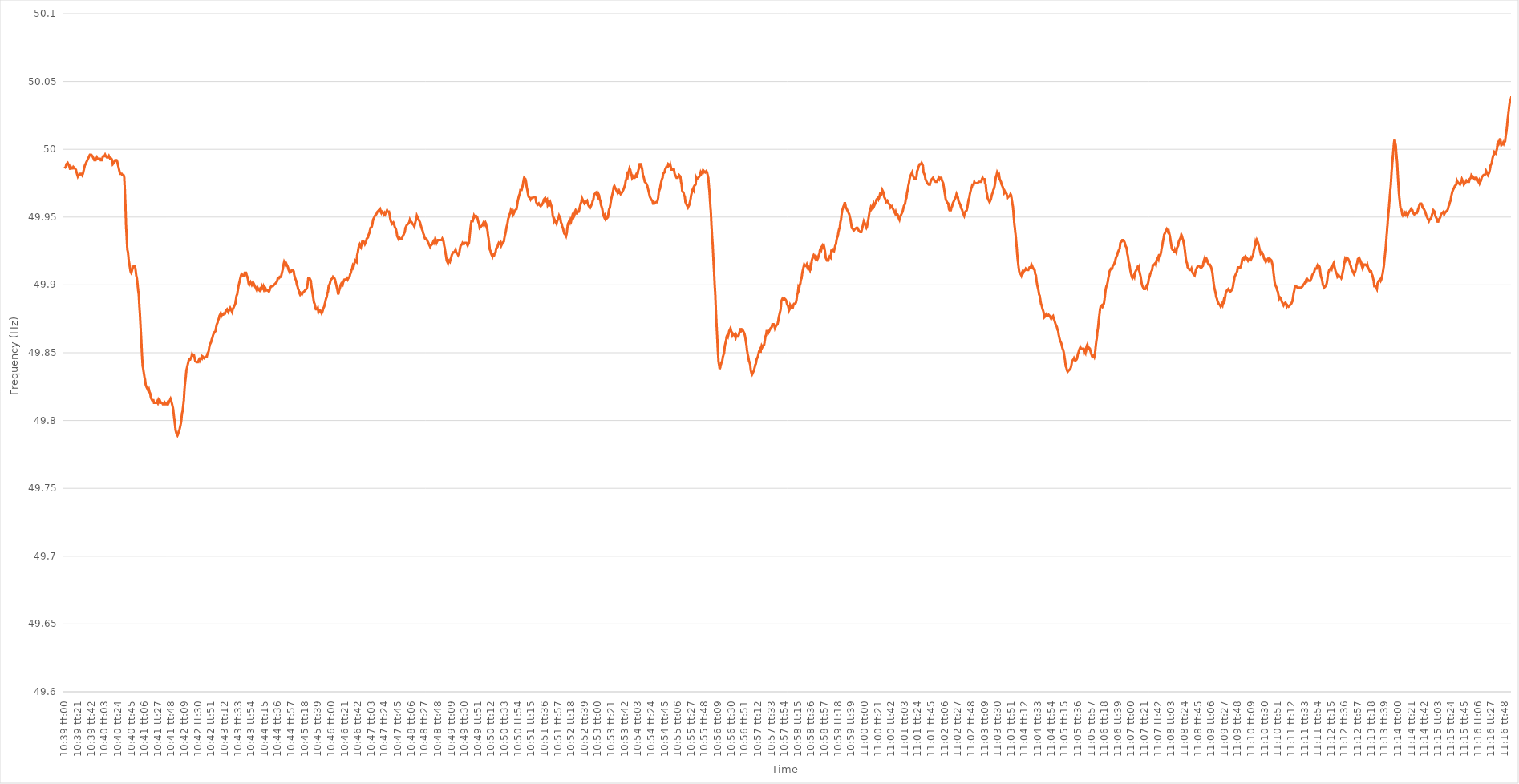
| Category | Series 0 |
|---|---|
| 0.44375000000000003 | 49.986 |
| 0.44376157407407407 | 49.986 |
| 0.44377314814814817 | 49.987 |
| 0.4437847222222222 | 49.989 |
| 0.4437962962962963 | 49.989 |
| 0.44380787037037034 | 49.99 |
| 0.4438194444444445 | 49.989 |
| 0.4438310185185185 | 49.989 |
| 0.4438425925925926 | 49.987 |
| 0.44385416666666666 | 49.985 |
| 0.44386574074074076 | 49.987 |
| 0.4438773148148148 | 49.986 |
| 0.44388888888888894 | 49.986 |
| 0.443900462962963 | 49.986 |
| 0.443912037037037 | 49.987 |
| 0.4439236111111111 | 49.987 |
| 0.44393518518518515 | 49.986 |
| 0.44394675925925925 | 49.986 |
| 0.4439583333333333 | 49.985 |
| 0.44396990740740744 | 49.983 |
| 0.4439814814814815 | 49.983 |
| 0.44399305555555557 | 49.98 |
| 0.4440046296296296 | 49.981 |
| 0.4440162037037037 | 49.981 |
| 0.44402777777777774 | 49.981 |
| 0.4440393518518519 | 49.982 |
| 0.44405092592592593 | 49.982 |
| 0.4440625 | 49.982 |
| 0.44407407407407407 | 49.981 |
| 0.44408564814814816 | 49.982 |
| 0.4440972222222222 | 49.984 |
| 0.44410879629629635 | 49.986 |
| 0.4441203703703704 | 49.988 |
| 0.4441319444444444 | 49.988 |
| 0.4441435185185185 | 49.99 |
| 0.44415509259259256 | 49.991 |
| 0.44416666666666665 | 49.992 |
| 0.4441782407407407 | 49.993 |
| 0.44418981481481484 | 49.994 |
| 0.4442013888888889 | 49.995 |
| 0.444212962962963 | 49.996 |
| 0.444224537037037 | 49.996 |
| 0.4442361111111111 | 49.996 |
| 0.44424768518518515 | 49.996 |
| 0.4442592592592593 | 49.995 |
| 0.44427083333333334 | 49.994 |
| 0.44428240740740743 | 49.994 |
| 0.44429398148148147 | 49.992 |
| 0.44430555555555556 | 49.992 |
| 0.4443171296296296 | 49.992 |
| 0.44432870370370375 | 49.992 |
| 0.4443402777777778 | 49.994 |
| 0.4443518518518519 | 49.993 |
| 0.4443634259259259 | 49.993 |
| 0.44437499999999996 | 49.993 |
| 0.44438657407407406 | 49.993 |
| 0.4443981481481481 | 49.993 |
| 0.44440972222222225 | 49.992 |
| 0.4444212962962963 | 49.992 |
| 0.4444328703703704 | 49.992 |
| 0.4444444444444444 | 49.994 |
| 0.4444560185185185 | 49.995 |
| 0.44446759259259255 | 49.995 |
| 0.4444791666666667 | 49.995 |
| 0.44449074074074074 | 49.996 |
| 0.44450231481481484 | 49.995 |
| 0.4445138888888889 | 49.995 |
| 0.44452546296296297 | 49.994 |
| 0.444537037037037 | 49.994 |
| 0.44454861111111116 | 49.994 |
| 0.4445601851851852 | 49.995 |
| 0.4445717592592593 | 49.994 |
| 0.44458333333333333 | 49.993 |
| 0.4445949074074074 | 49.993 |
| 0.44460648148148146 | 49.993 |
| 0.4446180555555555 | 49.992 |
| 0.44462962962962965 | 49.989 |
| 0.4446412037037037 | 49.989 |
| 0.4446527777777778 | 49.99 |
| 0.4446643518518518 | 49.991 |
| 0.4446759259259259 | 49.992 |
| 0.44468749999999996 | 49.992 |
| 0.4446990740740741 | 49.992 |
| 0.44471064814814815 | 49.991 |
| 0.44472222222222224 | 49.989 |
| 0.4447337962962963 | 49.987 |
| 0.4447453703703704 | 49.985 |
| 0.4447569444444444 | 49.983 |
| 0.44476851851851856 | 49.982 |
| 0.4447800925925926 | 49.982 |
| 0.4447916666666667 | 49.982 |
| 0.44480324074074074 | 49.981 |
| 0.44481481481481483 | 49.981 |
| 0.44482638888888887 | 49.981 |
| 0.444837962962963 | 49.98 |
| 0.44484953703703706 | 49.971 |
| 0.4448611111111111 | 49.959 |
| 0.4448726851851852 | 49.943 |
| 0.44488425925925923 | 49.935 |
| 0.4448958333333333 | 49.926 |
| 0.44490740740740736 | 49.924 |
| 0.4449189814814815 | 49.919 |
| 0.44493055555555555 | 49.916 |
| 0.44494212962962965 | 49.913 |
| 0.4449537037037037 | 49.91 |
| 0.4449652777777778 | 49.909 |
| 0.4449768518518518 | 49.91 |
| 0.44498842592592597 | 49.912 |
| 0.445 | 49.913 |
| 0.4450115740740741 | 49.914 |
| 0.44502314814814814 | 49.914 |
| 0.44503472222222223 | 49.914 |
| 0.4450462962962963 | 49.911 |
| 0.4450578703703704 | 49.907 |
| 0.44506944444444446 | 49.905 |
| 0.4450810185185185 | 49.901 |
| 0.4450925925925926 | 49.896 |
| 0.44510416666666663 | 49.893 |
| 0.44511574074074073 | 49.884 |
| 0.44512731481481477 | 49.877 |
| 0.4451388888888889 | 49.868 |
| 0.44515046296296296 | 49.859 |
| 0.44516203703703705 | 49.849 |
| 0.4451736111111111 | 49.841 |
| 0.4451851851851852 | 49.838 |
| 0.4451967592592592 | 49.835 |
| 0.4452083333333334 | 49.832 |
| 0.4452199074074074 | 49.83 |
| 0.4452314814814815 | 49.826 |
| 0.44524305555555554 | 49.825 |
| 0.44525462962962964 | 49.824 |
| 0.4452662037037037 | 49.823 |
| 0.44527777777777783 | 49.822 |
| 0.44528935185185187 | 49.823 |
| 0.44530092592592596 | 49.821 |
| 0.4453125 | 49.82 |
| 0.44532407407407404 | 49.817 |
| 0.44533564814814813 | 49.817 |
| 0.44534722222222217 | 49.815 |
| 0.4453587962962963 | 49.815 |
| 0.44537037037037036 | 49.815 |
| 0.44538194444444446 | 49.813 |
| 0.4453935185185185 | 49.813 |
| 0.4454050925925926 | 49.813 |
| 0.4454166666666666 | 49.813 |
| 0.4454282407407408 | 49.813 |
| 0.4454398148148148 | 49.814 |
| 0.4454513888888889 | 49.813 |
| 0.44546296296296295 | 49.815 |
| 0.44547453703703704 | 49.814 |
| 0.4454861111111111 | 49.815 |
| 0.44549768518518523 | 49.815 |
| 0.44550925925925927 | 49.813 |
| 0.44552083333333337 | 49.813 |
| 0.4455324074074074 | 49.813 |
| 0.4455439814814815 | 49.812 |
| 0.44555555555555554 | 49.812 |
| 0.4455671296296296 | 49.812 |
| 0.4455787037037037 | 49.813 |
| 0.44559027777777777 | 49.812 |
| 0.44560185185185186 | 49.812 |
| 0.4456134259259259 | 49.812 |
| 0.445625 | 49.813 |
| 0.44563657407407403 | 49.812 |
| 0.4456481481481482 | 49.813 |
| 0.4456597222222222 | 49.814 |
| 0.4456712962962963 | 49.814 |
| 0.44568287037037035 | 49.816 |
| 0.44569444444444445 | 49.816 |
| 0.4457060185185185 | 49.813 |
| 0.44571759259259264 | 49.811 |
| 0.4457291666666667 | 49.809 |
| 0.44574074074074077 | 49.805 |
| 0.4457523148148148 | 49.801 |
| 0.4457638888888889 | 49.797 |
| 0.44577546296296294 | 49.793 |
| 0.445787037037037 | 49.791 |
| 0.44579861111111113 | 49.79 |
| 0.44581018518518517 | 49.789 |
| 0.44582175925925926 | 49.79 |
| 0.4458333333333333 | 49.792 |
| 0.4458449074074074 | 49.793 |
| 0.44585648148148144 | 49.793 |
| 0.4458680555555556 | 49.797 |
| 0.4458796296296296 | 49.8 |
| 0.4458912037037037 | 49.805 |
| 0.44590277777777776 | 49.807 |
| 0.44591435185185185 | 49.811 |
| 0.4459259259259259 | 49.815 |
| 0.44593750000000004 | 49.823 |
| 0.4459490740740741 | 49.828 |
| 0.4459606481481482 | 49.832 |
| 0.4459722222222222 | 49.837 |
| 0.4459837962962963 | 49.839 |
| 0.44599537037037035 | 49.841 |
| 0.4460069444444445 | 49.841 |
| 0.44601851851851854 | 49.845 |
| 0.4460300925925926 | 49.845 |
| 0.44604166666666667 | 49.845 |
| 0.4460532407407407 | 49.846 |
| 0.4460648148148148 | 49.847 |
| 0.44607638888888884 | 49.849 |
| 0.446087962962963 | 49.848 |
| 0.44609953703703703 | 49.848 |
| 0.4461111111111111 | 49.848 |
| 0.44612268518518516 | 49.846 |
| 0.44613425925925926 | 49.844 |
| 0.4461458333333333 | 49.844 |
| 0.44615740740740745 | 49.843 |
| 0.4461689814814815 | 49.843 |
| 0.4461805555555556 | 49.843 |
| 0.4461921296296296 | 49.844 |
| 0.4462037037037037 | 49.845 |
| 0.44621527777777775 | 49.844 |
| 0.4462268518518519 | 49.844 |
| 0.44623842592592594 | 49.846 |
| 0.44625000000000004 | 49.847 |
| 0.4462615740740741 | 49.846 |
| 0.4462731481481481 | 49.847 |
| 0.4462847222222222 | 49.847 |
| 0.44629629629629625 | 49.846 |
| 0.4463078703703704 | 49.846 |
| 0.44631944444444444 | 49.847 |
| 0.44633101851851853 | 49.847 |
| 0.44634259259259257 | 49.847 |
| 0.44635416666666666 | 49.849 |
| 0.4463657407407407 | 49.85 |
| 0.44637731481481485 | 49.851 |
| 0.4463888888888889 | 49.854 |
| 0.446400462962963 | 49.856 |
| 0.446412037037037 | 49.857 |
| 0.4464236111111111 | 49.858 |
| 0.44643518518518516 | 49.86 |
| 0.4464467592592593 | 49.861 |
| 0.44645833333333335 | 49.863 |
| 0.44646990740740744 | 49.864 |
| 0.4464814814814815 | 49.865 |
| 0.4464930555555556 | 49.865 |
| 0.4465046296296296 | 49.866 |
| 0.44651620370370365 | 49.869 |
| 0.4465277777777778 | 49.871 |
| 0.44653935185185184 | 49.872 |
| 0.44655092592592593 | 49.874 |
| 0.4465625 | 49.875 |
| 0.44657407407407407 | 49.877 |
| 0.4465856481481481 | 49.878 |
| 0.44659722222222226 | 49.879 |
| 0.4466087962962963 | 49.877 |
| 0.4466203703703704 | 49.878 |
| 0.44663194444444443 | 49.878 |
| 0.4466435185185185 | 49.878 |
| 0.44665509259259256 | 49.879 |
| 0.4466666666666667 | 49.879 |
| 0.44667824074074075 | 49.879 |
| 0.44668981481481485 | 49.881 |
| 0.4467013888888889 | 49.881 |
| 0.446712962962963 | 49.882 |
| 0.446724537037037 | 49.882 |
| 0.44673611111111106 | 49.88 |
| 0.4467476851851852 | 49.881 |
| 0.44675925925925924 | 49.882 |
| 0.44677083333333334 | 49.883 |
| 0.4467824074074074 | 49.882 |
| 0.4467939814814815 | 49.881 |
| 0.4468055555555555 | 49.88 |
| 0.44681712962962966 | 49.882 |
| 0.4468287037037037 | 49.883 |
| 0.4468402777777778 | 49.884 |
| 0.44685185185185183 | 49.885 |
| 0.44686342592592593 | 49.886 |
| 0.44687499999999997 | 49.889 |
| 0.4468865740740741 | 49.892 |
| 0.44689814814814816 | 49.893 |
| 0.44690972222222225 | 49.896 |
| 0.4469212962962963 | 49.899 |
| 0.4469328703703704 | 49.901 |
| 0.4469444444444444 | 49.903 |
| 0.44695601851851857 | 49.905 |
| 0.4469675925925926 | 49.907 |
| 0.44697916666666665 | 49.908 |
| 0.44699074074074074 | 49.908 |
| 0.4470023148148148 | 49.907 |
| 0.4470138888888889 | 49.907 |
| 0.4470254629629629 | 49.907 |
| 0.44703703703703707 | 49.909 |
| 0.4470486111111111 | 49.909 |
| 0.4470601851851852 | 49.909 |
| 0.44707175925925924 | 49.907 |
| 0.44708333333333333 | 49.906 |
| 0.44709490740740737 | 49.904 |
| 0.4471064814814815 | 49.901 |
| 0.44711805555555556 | 49.9 |
| 0.44712962962962965 | 49.901 |
| 0.4471412037037037 | 49.902 |
| 0.4471527777777778 | 49.901 |
| 0.4471643518518518 | 49.9 |
| 0.447175925925926 | 49.901 |
| 0.4471875 | 49.902 |
| 0.4471990740740741 | 49.901 |
| 0.44721064814814815 | 49.9 |
| 0.4472222222222222 | 49.899 |
| 0.4472337962962963 | 49.898 |
| 0.4472453703703703 | 49.897 |
| 0.44725694444444447 | 49.896 |
| 0.4472685185185185 | 49.898 |
| 0.4472800925925926 | 49.897 |
| 0.44729166666666664 | 49.897 |
| 0.44730324074074074 | 49.896 |
| 0.4473148148148148 | 49.897 |
| 0.4473263888888889 | 49.896 |
| 0.44733796296296297 | 49.897 |
| 0.44734953703703706 | 49.899 |
| 0.4473611111111111 | 49.898 |
| 0.4473726851851852 | 49.899 |
| 0.44738425925925923 | 49.897 |
| 0.4473958333333334 | 49.898 |
| 0.4474074074074074 | 49.896 |
| 0.4474189814814815 | 49.897 |
| 0.44743055555555555 | 49.896 |
| 0.44744212962962965 | 49.896 |
| 0.4474537037037037 | 49.896 |
| 0.4474652777777777 | 49.896 |
| 0.4474768518518519 | 49.895 |
| 0.4474884259259259 | 49.896 |
| 0.4475 | 49.898 |
| 0.44751157407407405 | 49.898 |
| 0.44752314814814814 | 49.899 |
| 0.4475347222222222 | 49.899 |
| 0.44754629629629633 | 49.899 |
| 0.44755787037037037 | 49.899 |
| 0.44756944444444446 | 49.9 |
| 0.4475810185185185 | 49.9 |
| 0.4475925925925926 | 49.901 |
| 0.44760416666666664 | 49.901 |
| 0.4476157407407408 | 49.902 |
| 0.4476273148148148 | 49.903 |
| 0.4476388888888889 | 49.905 |
| 0.44765046296296296 | 49.905 |
| 0.44766203703703705 | 49.905 |
| 0.4476736111111111 | 49.906 |
| 0.44768518518518513 | 49.906 |
| 0.4476967592592593 | 49.906 |
| 0.4477083333333333 | 49.908 |
| 0.4477199074074074 | 49.91 |
| 0.44773148148148145 | 49.912 |
| 0.44774305555555555 | 49.915 |
| 0.4477546296296296 | 49.917 |
| 0.44776620370370374 | 49.917 |
| 0.4477777777777778 | 49.915 |
| 0.44778935185185187 | 49.916 |
| 0.4478009259259259 | 49.916 |
| 0.4478125 | 49.914 |
| 0.44782407407407404 | 49.913 |
| 0.4478356481481482 | 49.911 |
| 0.44784722222222223 | 49.911 |
| 0.4478587962962963 | 49.909 |
| 0.44787037037037036 | 49.909 |
| 0.44788194444444446 | 49.91 |
| 0.4478935185185185 | 49.911 |
| 0.44790509259259265 | 49.911 |
| 0.4479166666666667 | 49.911 |
| 0.4479282407407407 | 49.91 |
| 0.4479398148148148 | 49.907 |
| 0.44795138888888886 | 49.907 |
| 0.44796296296296295 | 49.904 |
| 0.447974537037037 | 49.903 |
| 0.44798611111111114 | 49.9 |
| 0.4479976851851852 | 49.899 |
| 0.4480092592592593 | 49.897 |
| 0.4480208333333333 | 49.896 |
| 0.4480324074074074 | 49.894 |
| 0.44804398148148145 | 49.893 |
| 0.4480555555555556 | 49.894 |
| 0.44806712962962963 | 49.894 |
| 0.44807870370370373 | 49.893 |
| 0.44809027777777777 | 49.894 |
| 0.44810185185185186 | 49.894 |
| 0.4481134259259259 | 49.895 |
| 0.44812500000000005 | 49.895 |
| 0.4481365740740741 | 49.896 |
| 0.4481481481481482 | 49.896 |
| 0.4481597222222222 | 49.897 |
| 0.44817129629629626 | 49.898 |
| 0.44818287037037036 | 49.901 |
| 0.4481944444444444 | 49.905 |
| 0.44820601851851855 | 49.905 |
| 0.4482175925925926 | 49.905 |
| 0.4482291666666667 | 49.904 |
| 0.4482407407407407 | 49.903 |
| 0.4482523148148148 | 49.899 |
| 0.44826388888888885 | 49.896 |
| 0.448275462962963 | 49.893 |
| 0.44828703703703704 | 49.89 |
| 0.44829861111111113 | 49.887 |
| 0.4483101851851852 | 49.886 |
| 0.44832175925925927 | 49.884 |
| 0.4483333333333333 | 49.882 |
| 0.44834490740740746 | 49.882 |
| 0.4483564814814815 | 49.882 |
| 0.4483680555555556 | 49.883 |
| 0.44837962962962963 | 49.88 |
| 0.44839120370370367 | 49.881 |
| 0.44840277777777776 | 49.881 |
| 0.4484143518518518 | 49.881 |
| 0.44842592592592595 | 49.88 |
| 0.4484375 | 49.879 |
| 0.4484490740740741 | 49.88 |
| 0.4484606481481481 | 49.88 |
| 0.4484722222222222 | 49.883 |
| 0.44848379629629626 | 49.884 |
| 0.4484953703703704 | 49.886 |
| 0.44850694444444444 | 49.888 |
| 0.44851851851851854 | 49.89 |
| 0.4485300925925926 | 49.891 |
| 0.44854166666666667 | 49.894 |
| 0.4485532407407407 | 49.895 |
| 0.44856481481481486 | 49.899 |
| 0.4485763888888889 | 49.899 |
| 0.448587962962963 | 49.901 |
| 0.44859953703703703 | 49.903 |
| 0.4486111111111111 | 49.904 |
| 0.44862268518518517 | 49.904 |
| 0.4486342592592592 | 49.905 |
| 0.44864583333333335 | 49.906 |
| 0.4486574074074074 | 49.906 |
| 0.4486689814814815 | 49.905 |
| 0.4486805555555555 | 49.904 |
| 0.4486921296296296 | 49.902 |
| 0.44870370370370366 | 49.9 |
| 0.4487152777777778 | 49.898 |
| 0.44872685185185185 | 49.896 |
| 0.44873842592592594 | 49.893 |
| 0.44875 | 49.895 |
| 0.4487615740740741 | 49.895 |
| 0.4487731481481481 | 49.898 |
| 0.44878472222222227 | 49.9 |
| 0.4487962962962963 | 49.901 |
| 0.4488078703703704 | 49.901 |
| 0.44881944444444444 | 49.9 |
| 0.44883101851851853 | 49.902 |
| 0.44884259259259257 | 49.903 |
| 0.4488541666666667 | 49.904 |
| 0.44886574074074076 | 49.904 |
| 0.4488773148148148 | 49.904 |
| 0.4488888888888889 | 49.904 |
| 0.44890046296296293 | 49.905 |
| 0.448912037037037 | 49.904 |
| 0.44892361111111106 | 49.905 |
| 0.4489351851851852 | 49.905 |
| 0.44894675925925925 | 49.906 |
| 0.44895833333333335 | 49.908 |
| 0.4489699074074074 | 49.909 |
| 0.4489814814814815 | 49.911 |
| 0.4489930555555555 | 49.912 |
| 0.44900462962962967 | 49.914 |
| 0.4490162037037037 | 49.913 |
| 0.4490277777777778 | 49.915 |
| 0.44903935185185184 | 49.915 |
| 0.44905092592592594 | 49.918 |
| 0.4490625 | 49.918 |
| 0.4490740740740741 | 49.917 |
| 0.44908564814814816 | 49.922 |
| 0.44909722222222226 | 49.924 |
| 0.4491087962962963 | 49.927 |
| 0.44912037037037034 | 49.929 |
| 0.44913194444444443 | 49.93 |
| 0.44914351851851847 | 49.929 |
| 0.4491550925925926 | 49.928 |
| 0.44916666666666666 | 49.93 |
| 0.44917824074074075 | 49.932 |
| 0.4491898148148148 | 49.932 |
| 0.4492013888888889 | 49.932 |
| 0.4492129629629629 | 49.931 |
| 0.4492245370370371 | 49.93 |
| 0.4492361111111111 | 49.93 |
| 0.4492476851851852 | 49.932 |
| 0.44925925925925925 | 49.934 |
| 0.44927083333333334 | 49.934 |
| 0.4492824074074074 | 49.935 |
| 0.44929398148148153 | 49.937 |
| 0.44930555555555557 | 49.938 |
| 0.44931712962962966 | 49.94 |
| 0.4493287037037037 | 49.942 |
| 0.44934027777777774 | 49.942 |
| 0.44935185185185184 | 49.943 |
| 0.4493634259259259 | 49.945 |
| 0.449375 | 49.948 |
| 0.44938657407407406 | 49.949 |
| 0.44939814814814816 | 49.95 |
| 0.4494097222222222 | 49.951 |
| 0.4494212962962963 | 49.951 |
| 0.44943287037037033 | 49.952 |
| 0.4494444444444445 | 49.953 |
| 0.4494560185185185 | 49.954 |
| 0.4494675925925926 | 49.954 |
| 0.44947916666666665 | 49.955 |
| 0.44949074074074075 | 49.955 |
| 0.4495023148148148 | 49.956 |
| 0.44951388888888894 | 49.954 |
| 0.449525462962963 | 49.953 |
| 0.44953703703703707 | 49.954 |
| 0.4495486111111111 | 49.954 |
| 0.4495601851851852 | 49.953 |
| 0.44957175925925924 | 49.952 |
| 0.4495833333333333 | 49.953 |
| 0.44959490740740743 | 49.952 |
| 0.44960648148148147 | 49.953 |
| 0.44961805555555556 | 49.954 |
| 0.4496296296296296 | 49.955 |
| 0.4496412037037037 | 49.954 |
| 0.44965277777777773 | 49.954 |
| 0.4496643518518519 | 49.954 |
| 0.4496759259259259 | 49.952 |
| 0.4496875 | 49.949 |
| 0.44969907407407406 | 49.947 |
| 0.44971064814814815 | 49.946 |
| 0.4497222222222222 | 49.945 |
| 0.44973379629629634 | 49.945 |
| 0.4497453703703704 | 49.946 |
| 0.4497569444444445 | 49.945 |
| 0.4497685185185185 | 49.943 |
| 0.4497800925925926 | 49.942 |
| 0.44979166666666665 | 49.941 |
| 0.4498032407407408 | 49.939 |
| 0.44981481481481483 | 49.936 |
| 0.4498263888888889 | 49.935 |
| 0.44983796296296297 | 49.934 |
| 0.449849537037037 | 49.935 |
| 0.4498611111111111 | 49.935 |
| 0.44987268518518514 | 49.934 |
| 0.4498842592592593 | 49.934 |
| 0.44989583333333333 | 49.934 |
| 0.4499074074074074 | 49.935 |
| 0.44991898148148146 | 49.936 |
| 0.44993055555555556 | 49.937 |
| 0.4499421296296296 | 49.937 |
| 0.44995370370370374 | 49.939 |
| 0.4499652777777778 | 49.942 |
| 0.4499768518518519 | 49.943 |
| 0.4499884259259259 | 49.944 |
| 0.45 | 49.944 |
| 0.45001157407407405 | 49.945 |
| 0.4500231481481482 | 49.945 |
| 0.45003472222222224 | 49.946 |
| 0.45004629629629633 | 49.948 |
| 0.45005787037037037 | 49.947 |
| 0.4500694444444444 | 49.947 |
| 0.4500810185185185 | 49.946 |
| 0.45009259259259254 | 49.945 |
| 0.4501041666666667 | 49.945 |
| 0.45011574074074073 | 49.944 |
| 0.4501273148148148 | 49.943 |
| 0.45013888888888887 | 49.945 |
| 0.45015046296296296 | 49.947 |
| 0.450162037037037 | 49.948 |
| 0.45017361111111115 | 49.951 |
| 0.4501851851851852 | 49.95 |
| 0.4501967592592593 | 49.949 |
| 0.4502083333333333 | 49.948 |
| 0.4502199074074074 | 49.948 |
| 0.45023148148148145 | 49.946 |
| 0.4502430555555556 | 49.944 |
| 0.45025462962962964 | 49.944 |
| 0.45026620370370374 | 49.941 |
| 0.4502777777777778 | 49.94 |
| 0.4502893518518518 | 49.938 |
| 0.4503009259259259 | 49.937 |
| 0.45031249999999995 | 49.935 |
| 0.4503240740740741 | 49.934 |
| 0.45033564814814814 | 49.934 |
| 0.45034722222222223 | 49.934 |
| 0.45035879629629627 | 49.933 |
| 0.45037037037037037 | 49.933 |
| 0.4503819444444444 | 49.931 |
| 0.45039351851851855 | 49.93 |
| 0.4504050925925926 | 49.929 |
| 0.4504166666666667 | 49.928 |
| 0.4504282407407407 | 49.929 |
| 0.4504398148148148 | 49.929 |
| 0.45045138888888886 | 49.93 |
| 0.450462962962963 | 49.931 |
| 0.45047453703703705 | 49.932 |
| 0.45048611111111114 | 49.931 |
| 0.4504976851851852 | 49.932 |
| 0.4505092592592593 | 49.934 |
| 0.4505208333333333 | 49.934 |
| 0.45053240740740735 | 49.931 |
| 0.4505439814814815 | 49.931 |
| 0.45055555555555554 | 49.933 |
| 0.45056712962962964 | 49.933 |
| 0.4505787037037037 | 49.933 |
| 0.45059027777777777 | 49.933 |
| 0.4506018518518518 | 49.933 |
| 0.45061342592592596 | 49.933 |
| 0.450625 | 49.933 |
| 0.4506365740740741 | 49.934 |
| 0.45064814814814813 | 49.933 |
| 0.4506597222222222 | 49.932 |
| 0.45067129629629626 | 49.929 |
| 0.4506828703703704 | 49.927 |
| 0.45069444444444445 | 49.924 |
| 0.45070601851851855 | 49.921 |
| 0.4507175925925926 | 49.918 |
| 0.4507291666666667 | 49.917 |
| 0.4507407407407407 | 49.916 |
| 0.45075231481481487 | 49.918 |
| 0.4507638888888889 | 49.918 |
| 0.45077546296296295 | 49.917 |
| 0.45078703703703704 | 49.919 |
| 0.4507986111111111 | 49.92 |
| 0.4508101851851852 | 49.922 |
| 0.4508217592592592 | 49.922 |
| 0.45083333333333336 | 49.924 |
| 0.4508449074074074 | 49.924 |
| 0.4508564814814815 | 49.924 |
| 0.45086805555555554 | 49.925 |
| 0.45087962962962963 | 49.926 |
| 0.45089120370370367 | 49.924 |
| 0.4509027777777778 | 49.924 |
| 0.45091435185185186 | 49.923 |
| 0.45092592592592595 | 49.922 |
| 0.4509375 | 49.922 |
| 0.4509490740740741 | 49.924 |
| 0.4509606481481481 | 49.927 |
| 0.4509722222222223 | 49.929 |
| 0.4509837962962963 | 49.929 |
| 0.45099537037037035 | 49.93 |
| 0.45100694444444445 | 49.931 |
| 0.4510185185185185 | 49.931 |
| 0.4510300925925926 | 49.93 |
| 0.4510416666666666 | 49.93 |
| 0.45105324074074077 | 49.931 |
| 0.4510648148148148 | 49.931 |
| 0.4510763888888889 | 49.931 |
| 0.45108796296296294 | 49.93 |
| 0.45109953703703703 | 49.929 |
| 0.4511111111111111 | 49.929 |
| 0.4511226851851852 | 49.931 |
| 0.45113425925925926 | 49.935 |
| 0.45114583333333336 | 49.94 |
| 0.4511574074074074 | 49.944 |
| 0.4511689814814815 | 49.947 |
| 0.45118055555555553 | 49.947 |
| 0.4511921296296297 | 49.947 |
| 0.4512037037037037 | 49.949 |
| 0.4512152777777778 | 49.951 |
| 0.45122685185185185 | 49.95 |
| 0.4512384259259259 | 49.95 |
| 0.45125 | 49.951 |
| 0.451261574074074 | 49.951 |
| 0.4512731481481482 | 49.95 |
| 0.4512847222222222 | 49.948 |
| 0.4512962962962963 | 49.946 |
| 0.45130787037037035 | 49.945 |
| 0.45131944444444444 | 49.942 |
| 0.4513310185185185 | 49.942 |
| 0.45134259259259263 | 49.943 |
| 0.45135416666666667 | 49.943 |
| 0.45136574074074076 | 49.944 |
| 0.4513773148148148 | 49.944 |
| 0.4513888888888889 | 49.946 |
| 0.45140046296296293 | 49.944 |
| 0.4514120370370371 | 49.945 |
| 0.4514236111111111 | 49.946 |
| 0.4514351851851852 | 49.945 |
| 0.45144675925925926 | 49.942 |
| 0.45145833333333335 | 49.941 |
| 0.4514699074074074 | 49.937 |
| 0.45148148148148143 | 49.934 |
| 0.4514930555555556 | 49.93 |
| 0.4515046296296296 | 49.926 |
| 0.4515162037037037 | 49.925 |
| 0.45152777777777775 | 49.923 |
| 0.45153935185185184 | 49.922 |
| 0.4515509259259259 | 49.921 |
| 0.45156250000000003 | 49.923 |
| 0.45157407407407407 | 49.921 |
| 0.45158564814814817 | 49.923 |
| 0.4515972222222222 | 49.923 |
| 0.4516087962962963 | 49.924 |
| 0.45162037037037034 | 49.927 |
| 0.4516319444444445 | 49.927 |
| 0.4516435185185185 | 49.928 |
| 0.4516550925925926 | 49.93 |
| 0.45166666666666666 | 49.931 |
| 0.45167824074074076 | 49.931 |
| 0.4516898148148148 | 49.93 |
| 0.45170138888888894 | 49.931 |
| 0.451712962962963 | 49.929 |
| 0.451724537037037 | 49.93 |
| 0.4517361111111111 | 49.931 |
| 0.45174768518518515 | 49.931 |
| 0.45175925925925925 | 49.932 |
| 0.4517708333333333 | 49.935 |
| 0.45178240740740744 | 49.937 |
| 0.4517939814814815 | 49.939 |
| 0.45180555555555557 | 49.942 |
| 0.4518171296296296 | 49.942 |
| 0.4518287037037037 | 49.946 |
| 0.45184027777777774 | 49.949 |
| 0.4518518518518519 | 49.95 |
| 0.45186342592592593 | 49.952 |
| 0.451875 | 49.953 |
| 0.45188657407407407 | 49.955 |
| 0.45189814814814816 | 49.954 |
| 0.4519097222222222 | 49.953 |
| 0.45192129629629635 | 49.952 |
| 0.4519328703703704 | 49.954 |
| 0.4519444444444444 | 49.953 |
| 0.4519560185185185 | 49.954 |
| 0.45196759259259256 | 49.955 |
| 0.45197916666666665 | 49.955 |
| 0.4519907407407407 | 49.956 |
| 0.45200231481481484 | 49.959 |
| 0.4520138888888889 | 49.962 |
| 0.452025462962963 | 49.962 |
| 0.452037037037037 | 49.966 |
| 0.4520486111111111 | 49.967 |
| 0.45206018518518515 | 49.97 |
| 0.4520717592592593 | 49.97 |
| 0.45208333333333334 | 49.97 |
| 0.45209490740740743 | 49.972 |
| 0.45210648148148147 | 49.974 |
| 0.45211805555555556 | 49.977 |
| 0.4521296296296296 | 49.979 |
| 0.45214120370370375 | 49.979 |
| 0.4521527777777778 | 49.978 |
| 0.4521643518518519 | 49.976 |
| 0.4521759259259259 | 49.972 |
| 0.45218749999999996 | 49.97 |
| 0.45219907407407406 | 49.967 |
| 0.4522106481481481 | 49.965 |
| 0.45222222222222225 | 49.965 |
| 0.4522337962962963 | 49.964 |
| 0.4522453703703704 | 49.963 |
| 0.4522569444444444 | 49.964 |
| 0.4522685185185185 | 49.964 |
| 0.45228009259259255 | 49.964 |
| 0.4522916666666667 | 49.964 |
| 0.45230324074074074 | 49.965 |
| 0.45231481481481484 | 49.965 |
| 0.4523263888888889 | 49.965 |
| 0.45233796296296297 | 49.964 |
| 0.452349537037037 | 49.961 |
| 0.45236111111111116 | 49.961 |
| 0.4523726851851852 | 49.959 |
| 0.4523842592592593 | 49.959 |
| 0.45239583333333333 | 49.96 |
| 0.4524074074074074 | 49.959 |
| 0.45241898148148146 | 49.959 |
| 0.4524305555555555 | 49.958 |
| 0.45244212962962965 | 49.958 |
| 0.4524537037037037 | 49.959 |
| 0.4524652777777778 | 49.96 |
| 0.4524768518518518 | 49.961 |
| 0.4524884259259259 | 49.963 |
| 0.45249999999999996 | 49.963 |
| 0.4525115740740741 | 49.964 |
| 0.45252314814814815 | 49.962 |
| 0.45253472222222224 | 49.962 |
| 0.4525462962962963 | 49.963 |
| 0.4525578703703704 | 49.959 |
| 0.4525694444444444 | 49.96 |
| 0.45258101851851856 | 49.958 |
| 0.4525925925925926 | 49.96 |
| 0.4526041666666667 | 49.961 |
| 0.45261574074074074 | 49.961 |
| 0.45262731481481483 | 49.958 |
| 0.45263888888888887 | 49.956 |
| 0.452650462962963 | 49.951 |
| 0.45266203703703706 | 49.95 |
| 0.4526736111111111 | 49.947 |
| 0.4526851851851852 | 49.948 |
| 0.45269675925925923 | 49.947 |
| 0.4527083333333333 | 49.946 |
| 0.45271990740740736 | 49.945 |
| 0.4527314814814815 | 49.947 |
| 0.45274305555555555 | 49.948 |
| 0.45275462962962965 | 49.949 |
| 0.4527662037037037 | 49.951 |
| 0.4527777777777778 | 49.95 |
| 0.4527893518518518 | 49.949 |
| 0.45280092592592597 | 49.946 |
| 0.4528125 | 49.945 |
| 0.4528240740740741 | 49.943 |
| 0.45283564814814814 | 49.942 |
| 0.45284722222222223 | 49.94 |
| 0.4528587962962963 | 49.938 |
| 0.4528703703703704 | 49.938 |
| 0.45288194444444446 | 49.937 |
| 0.4528935185185185 | 49.936 |
| 0.4529050925925926 | 49.938 |
| 0.45291666666666663 | 49.942 |
| 0.45292824074074073 | 49.945 |
| 0.45293981481481477 | 49.945 |
| 0.4529513888888889 | 49.947 |
| 0.45296296296296296 | 49.946 |
| 0.45297453703703705 | 49.948 |
| 0.4529861111111111 | 49.947 |
| 0.4529976851851852 | 49.949 |
| 0.4530092592592592 | 49.951 |
| 0.4530208333333334 | 49.953 |
| 0.4530324074074074 | 49.95 |
| 0.4530439814814815 | 49.951 |
| 0.45305555555555554 | 49.954 |
| 0.45306712962962964 | 49.955 |
| 0.4530787037037037 | 49.954 |
| 0.45309027777777783 | 49.952 |
| 0.45310185185185187 | 49.954 |
| 0.45311342592592596 | 49.954 |
| 0.453125 | 49.954 |
| 0.45313657407407404 | 49.956 |
| 0.45314814814814813 | 49.958 |
| 0.45315972222222217 | 49.96 |
| 0.4531712962962963 | 49.961 |
| 0.45318287037037036 | 49.964 |
| 0.45319444444444446 | 49.963 |
| 0.4532060185185185 | 49.962 |
| 0.4532175925925926 | 49.961 |
| 0.4532291666666666 | 49.96 |
| 0.4532407407407408 | 49.96 |
| 0.4532523148148148 | 49.961 |
| 0.4532638888888889 | 49.961 |
| 0.45327546296296295 | 49.962 |
| 0.45328703703703704 | 49.96 |
| 0.4532986111111111 | 49.96 |
| 0.45331018518518523 | 49.958 |
| 0.45332175925925927 | 49.958 |
| 0.45333333333333337 | 49.957 |
| 0.4533449074074074 | 49.958 |
| 0.4533564814814815 | 49.958 |
| 0.45336805555555554 | 49.96 |
| 0.4533796296296296 | 49.962 |
| 0.4533912037037037 | 49.963 |
| 0.45340277777777777 | 49.966 |
| 0.45341435185185186 | 49.967 |
| 0.4534259259259259 | 49.967 |
| 0.4534375 | 49.968 |
| 0.45344907407407403 | 49.967 |
| 0.4534606481481482 | 49.967 |
| 0.4534722222222222 | 49.965 |
| 0.4534837962962963 | 49.967 |
| 0.45349537037037035 | 49.966 |
| 0.45350694444444445 | 49.963 |
| 0.4535185185185185 | 49.962 |
| 0.45353009259259264 | 49.959 |
| 0.4535416666666667 | 49.959 |
| 0.45355324074074077 | 49.956 |
| 0.4535648148148148 | 49.953 |
| 0.4535763888888889 | 49.951 |
| 0.45358796296296294 | 49.95 |
| 0.453599537037037 | 49.951 |
| 0.45361111111111113 | 49.949 |
| 0.45362268518518517 | 49.95 |
| 0.45363425925925926 | 49.949 |
| 0.4536458333333333 | 49.949 |
| 0.4536574074074074 | 49.95 |
| 0.45366898148148144 | 49.954 |
| 0.4536805555555556 | 49.956 |
| 0.4536921296296296 | 49.957 |
| 0.4537037037037037 | 49.96 |
| 0.45371527777777776 | 49.963 |
| 0.45372685185185185 | 49.965 |
| 0.4537384259259259 | 49.967 |
| 0.45375000000000004 | 49.969 |
| 0.4537615740740741 | 49.972 |
| 0.4537731481481482 | 49.973 |
| 0.4537847222222222 | 49.972 |
| 0.4537962962962963 | 49.971 |
| 0.45380787037037035 | 49.97 |
| 0.4538194444444445 | 49.97 |
| 0.45383101851851854 | 49.968 |
| 0.4538425925925926 | 49.969 |
| 0.45385416666666667 | 49.967 |
| 0.4538657407407407 | 49.969 |
| 0.4538773148148148 | 49.968 |
| 0.45388888888888884 | 49.967 |
| 0.453900462962963 | 49.967 |
| 0.45391203703703703 | 49.968 |
| 0.4539236111111111 | 49.969 |
| 0.45393518518518516 | 49.97 |
| 0.45394675925925926 | 49.971 |
| 0.4539583333333333 | 49.971 |
| 0.45396990740740745 | 49.974 |
| 0.4539814814814815 | 49.977 |
| 0.4539930555555556 | 49.978 |
| 0.4540046296296296 | 49.981 |
| 0.4540162037037037 | 49.98 |
| 0.45402777777777775 | 49.983 |
| 0.4540393518518519 | 49.984 |
| 0.45405092592592594 | 49.986 |
| 0.45406250000000004 | 49.985 |
| 0.4540740740740741 | 49.983 |
| 0.4540856481481481 | 49.981 |
| 0.4540972222222222 | 49.979 |
| 0.45410879629629625 | 49.98 |
| 0.4541203703703704 | 49.979 |
| 0.45413194444444444 | 49.979 |
| 0.45414351851851853 | 49.979 |
| 0.45415509259259257 | 49.979 |
| 0.45416666666666666 | 49.981 |
| 0.4541782407407407 | 49.979 |
| 0.45418981481481485 | 49.979 |
| 0.4542013888888889 | 49.983 |
| 0.454212962962963 | 49.985 |
| 0.454224537037037 | 49.986 |
| 0.4542361111111111 | 49.989 |
| 0.45424768518518516 | 49.989 |
| 0.4542592592592593 | 49.989 |
| 0.45427083333333335 | 49.987 |
| 0.45428240740740744 | 49.985 |
| 0.4542939814814815 | 49.981 |
| 0.4543055555555556 | 49.98 |
| 0.4543171296296296 | 49.978 |
| 0.45432870370370365 | 49.976 |
| 0.4543402777777778 | 49.976 |
| 0.45435185185185184 | 49.975 |
| 0.45436342592592593 | 49.974 |
| 0.454375 | 49.973 |
| 0.45438657407407407 | 49.971 |
| 0.4543981481481481 | 49.969 |
| 0.45440972222222226 | 49.969 |
| 0.4544212962962963 | 49.965 |
| 0.4544328703703704 | 49.965 |
| 0.45444444444444443 | 49.963 |
| 0.4544560185185185 | 49.963 |
| 0.45446759259259256 | 49.962 |
| 0.4544791666666667 | 49.96 |
| 0.45449074074074075 | 49.96 |
| 0.45450231481481485 | 49.96 |
| 0.4545138888888889 | 49.96 |
| 0.454525462962963 | 49.961 |
| 0.454537037037037 | 49.961 |
| 0.45454861111111106 | 49.961 |
| 0.4545601851851852 | 49.962 |
| 0.45457175925925924 | 49.964 |
| 0.45458333333333334 | 49.968 |
| 0.4545949074074074 | 49.97 |
| 0.4546064814814815 | 49.971 |
| 0.4546180555555555 | 49.974 |
| 0.45462962962962966 | 49.976 |
| 0.4546412037037037 | 49.978 |
| 0.4546527777777778 | 49.979 |
| 0.45466435185185183 | 49.982 |
| 0.45467592592592593 | 49.982 |
| 0.45468749999999997 | 49.983 |
| 0.4546990740740741 | 49.985 |
| 0.45471064814814816 | 49.986 |
| 0.45472222222222225 | 49.987 |
| 0.4547337962962963 | 49.987 |
| 0.4547453703703704 | 49.987 |
| 0.4547569444444444 | 49.989 |
| 0.45476851851851857 | 49.989 |
| 0.4547800925925926 | 49.988 |
| 0.45479166666666665 | 49.989 |
| 0.45480324074074074 | 49.987 |
| 0.4548148148148148 | 49.985 |
| 0.4548263888888889 | 49.985 |
| 0.4548379629629629 | 49.985 |
| 0.45484953703703707 | 49.985 |
| 0.4548611111111111 | 49.985 |
| 0.4548726851851852 | 49.982 |
| 0.45488425925925924 | 49.981 |
| 0.45489583333333333 | 49.98 |
| 0.45490740740740737 | 49.979 |
| 0.4549189814814815 | 49.979 |
| 0.45493055555555556 | 49.979 |
| 0.45494212962962965 | 49.979 |
| 0.4549537037037037 | 49.981 |
| 0.4549652777777778 | 49.981 |
| 0.4549768518518518 | 49.98 |
| 0.454988425925926 | 49.976 |
| 0.455 | 49.974 |
| 0.4550115740740741 | 49.969 |
| 0.45502314814814815 | 49.969 |
| 0.4550347222222222 | 49.968 |
| 0.4550462962962963 | 49.966 |
| 0.4550578703703703 | 49.965 |
| 0.45506944444444447 | 49.961 |
| 0.4550810185185185 | 49.96 |
| 0.4550925925925926 | 49.959 |
| 0.45510416666666664 | 49.958 |
| 0.45511574074074074 | 49.957 |
| 0.4551273148148148 | 49.958 |
| 0.4551388888888889 | 49.959 |
| 0.45515046296296297 | 49.961 |
| 0.45516203703703706 | 49.963 |
| 0.4551736111111111 | 49.966 |
| 0.4551851851851852 | 49.968 |
| 0.45519675925925923 | 49.97 |
| 0.4552083333333334 | 49.971 |
| 0.4552199074074074 | 49.97 |
| 0.4552314814814815 | 49.973 |
| 0.45524305555555555 | 49.973 |
| 0.45525462962962965 | 49.974 |
| 0.4552662037037037 | 49.979 |
| 0.4552777777777777 | 49.978 |
| 0.4552893518518519 | 49.978 |
| 0.4553009259259259 | 49.979 |
| 0.4553125 | 49.979 |
| 0.45532407407407405 | 49.98 |
| 0.45533564814814814 | 49.981 |
| 0.4553472222222222 | 49.983 |
| 0.45535879629629633 | 49.982 |
| 0.45537037037037037 | 49.983 |
| 0.45538194444444446 | 49.984 |
| 0.4553935185185185 | 49.983 |
| 0.4554050925925926 | 49.984 |
| 0.45541666666666664 | 49.984 |
| 0.4554282407407408 | 49.983 |
| 0.4554398148148148 | 49.983 |
| 0.4554513888888889 | 49.984 |
| 0.45546296296296296 | 49.983 |
| 0.45547453703703705 | 49.983 |
| 0.4554861111111111 | 49.979 |
| 0.45549768518518513 | 49.973 |
| 0.4555092592592593 | 49.968 |
| 0.4555208333333333 | 49.96 |
| 0.4555324074074074 | 49.954 |
| 0.45554398148148145 | 49.944 |
| 0.45555555555555555 | 49.936 |
| 0.4555671296296296 | 49.929 |
| 0.45557870370370374 | 49.919 |
| 0.4555902777777778 | 49.911 |
| 0.45560185185185187 | 49.901 |
| 0.4556134259259259 | 49.893 |
| 0.455625 | 49.881 |
| 0.45563657407407404 | 49.871 |
| 0.4556481481481482 | 49.862 |
| 0.45565972222222223 | 49.852 |
| 0.4556712962962963 | 49.844 |
| 0.45568287037037036 | 49.841 |
| 0.45569444444444446 | 49.838 |
| 0.4557060185185185 | 49.84 |
| 0.45571759259259265 | 49.84 |
| 0.4557291666666667 | 49.843 |
| 0.4557407407407407 | 49.844 |
| 0.4557523148148148 | 49.847 |
| 0.45576388888888886 | 49.847 |
| 0.45577546296296295 | 49.85 |
| 0.455787037037037 | 49.855 |
| 0.45579861111111114 | 49.857 |
| 0.4558101851851852 | 49.859 |
| 0.4558217592592593 | 49.862 |
| 0.4558333333333333 | 49.863 |
| 0.4558449074074074 | 49.862 |
| 0.45585648148148145 | 49.864 |
| 0.4558680555555556 | 49.866 |
| 0.45587962962962963 | 49.867 |
| 0.45589120370370373 | 49.868 |
| 0.45590277777777777 | 49.866 |
| 0.45591435185185186 | 49.865 |
| 0.4559259259259259 | 49.863 |
| 0.45593750000000005 | 49.864 |
| 0.4559490740740741 | 49.864 |
| 0.4559606481481482 | 49.863 |
| 0.4559722222222222 | 49.863 |
| 0.45598379629629626 | 49.861 |
| 0.45599537037037036 | 49.863 |
| 0.4560069444444444 | 49.862 |
| 0.45601851851851855 | 49.862 |
| 0.4560300925925926 | 49.862 |
| 0.4560416666666667 | 49.863 |
| 0.4560532407407407 | 49.865 |
| 0.4560648148148148 | 49.866 |
| 0.45607638888888885 | 49.868 |
| 0.456087962962963 | 49.866 |
| 0.45609953703703704 | 49.866 |
| 0.45611111111111113 | 49.867 |
| 0.4561226851851852 | 49.866 |
| 0.45613425925925927 | 49.866 |
| 0.4561458333333333 | 49.864 |
| 0.45615740740740746 | 49.862 |
| 0.4561689814814815 | 49.859 |
| 0.4561805555555556 | 49.856 |
| 0.45619212962962963 | 49.852 |
| 0.45620370370370367 | 49.849 |
| 0.45621527777777776 | 49.847 |
| 0.4562268518518518 | 49.844 |
| 0.45623842592592595 | 49.843 |
| 0.45625 | 49.841 |
| 0.4562615740740741 | 49.837 |
| 0.4562731481481481 | 49.835 |
| 0.4562847222222222 | 49.834 |
| 0.45629629629629626 | 49.835 |
| 0.4563078703703704 | 49.835 |
| 0.45631944444444444 | 49.837 |
| 0.45633101851851854 | 49.839 |
| 0.4563425925925926 | 49.841 |
| 0.45635416666666667 | 49.842 |
| 0.4563657407407407 | 49.845 |
| 0.45637731481481486 | 49.846 |
| 0.4563888888888889 | 49.847 |
| 0.456400462962963 | 49.849 |
| 0.45641203703703703 | 49.851 |
| 0.4564236111111111 | 49.852 |
| 0.45643518518518517 | 49.85 |
| 0.4564467592592592 | 49.853 |
| 0.45645833333333335 | 49.855 |
| 0.4564699074074074 | 49.854 |
| 0.4564814814814815 | 49.855 |
| 0.4564930555555555 | 49.855 |
| 0.4565046296296296 | 49.856 |
| 0.45651620370370366 | 49.859 |
| 0.4565277777777778 | 49.862 |
| 0.45653935185185185 | 49.863 |
| 0.45655092592592594 | 49.866 |
| 0.4565625 | 49.866 |
| 0.4565740740740741 | 49.866 |
| 0.4565856481481481 | 49.865 |
| 0.45659722222222227 | 49.866 |
| 0.4566087962962963 | 49.867 |
| 0.4566203703703704 | 49.868 |
| 0.45663194444444444 | 49.868 |
| 0.45664351851851853 | 49.869 |
| 0.45665509259259257 | 49.871 |
| 0.4566666666666667 | 49.871 |
| 0.45667824074074076 | 49.871 |
| 0.4566898148148148 | 49.87 |
| 0.4567013888888889 | 49.868 |
| 0.45671296296296293 | 49.869 |
| 0.456724537037037 | 49.87 |
| 0.45673611111111106 | 49.87 |
| 0.4567476851851852 | 49.871 |
| 0.45675925925925925 | 49.873 |
| 0.45677083333333335 | 49.876 |
| 0.4567824074074074 | 49.878 |
| 0.4567939814814815 | 49.88 |
| 0.4568055555555555 | 49.882 |
| 0.45681712962962967 | 49.888 |
| 0.4568287037037037 | 49.889 |
| 0.4568402777777778 | 49.89 |
| 0.45685185185185184 | 49.89 |
| 0.45686342592592594 | 49.889 |
| 0.456875 | 49.89 |
| 0.4568865740740741 | 49.89 |
| 0.45689814814814816 | 49.889 |
| 0.45690972222222226 | 49.888 |
| 0.4569212962962963 | 49.886 |
| 0.45693287037037034 | 49.886 |
| 0.45694444444444443 | 49.884 |
| 0.45695601851851847 | 49.881 |
| 0.4569675925925926 | 49.882 |
| 0.45697916666666666 | 49.885 |
| 0.45699074074074075 | 49.885 |
| 0.4570023148148148 | 49.883 |
| 0.4570138888888889 | 49.883 |
| 0.4570254629629629 | 49.883 |
| 0.4570370370370371 | 49.885 |
| 0.4570486111111111 | 49.886 |
| 0.4570601851851852 | 49.886 |
| 0.45707175925925925 | 49.886 |
| 0.45708333333333334 | 49.887 |
| 0.4570949074074074 | 49.889 |
| 0.45710648148148153 | 49.893 |
| 0.45711805555555557 | 49.894 |
| 0.45712962962962966 | 49.898 |
| 0.4571412037037037 | 49.897 |
| 0.45715277777777774 | 49.9 |
| 0.45716435185185184 | 49.901 |
| 0.4571759259259259 | 49.904 |
| 0.4571875 | 49.905 |
| 0.45719907407407406 | 49.909 |
| 0.45721064814814816 | 49.911 |
| 0.4572222222222222 | 49.913 |
| 0.4572337962962963 | 49.915 |
| 0.45724537037037033 | 49.914 |
| 0.4572569444444445 | 49.914 |
| 0.4572685185185185 | 49.914 |
| 0.4572800925925926 | 49.915 |
| 0.45729166666666665 | 49.913 |
| 0.45730324074074075 | 49.912 |
| 0.4573148148148148 | 49.913 |
| 0.45732638888888894 | 49.912 |
| 0.457337962962963 | 49.911 |
| 0.45734953703703707 | 49.914 |
| 0.4573611111111111 | 49.913 |
| 0.4573726851851852 | 49.918 |
| 0.45738425925925924 | 49.918 |
| 0.4573958333333333 | 49.921 |
| 0.45740740740740743 | 49.922 |
| 0.45741898148148147 | 49.922 |
| 0.45743055555555556 | 49.92 |
| 0.4574421296296296 | 49.921 |
| 0.4574537037037037 | 49.919 |
| 0.45746527777777773 | 49.92 |
| 0.4574768518518519 | 49.919 |
| 0.4574884259259259 | 49.92 |
| 0.4575 | 49.922 |
| 0.45751157407407406 | 49.923 |
| 0.45752314814814815 | 49.926 |
| 0.4575347222222222 | 49.927 |
| 0.45754629629629634 | 49.926 |
| 0.4575578703703704 | 49.928 |
| 0.4575694444444445 | 49.929 |
| 0.4575810185185185 | 49.928 |
| 0.4575925925925926 | 49.929 |
| 0.45760416666666665 | 49.927 |
| 0.4576157407407408 | 49.924 |
| 0.45762731481481483 | 49.92 |
| 0.4576388888888889 | 49.92 |
| 0.45765046296296297 | 49.918 |
| 0.457662037037037 | 49.918 |
| 0.4576736111111111 | 49.918 |
| 0.45768518518518514 | 49.92 |
| 0.4576967592592593 | 49.921 |
| 0.45770833333333333 | 49.921 |
| 0.4577199074074074 | 49.92 |
| 0.45773148148148146 | 49.926 |
| 0.45774305555555556 | 49.925 |
| 0.4577546296296296 | 49.926 |
| 0.45776620370370374 | 49.926 |
| 0.4577777777777778 | 49.925 |
| 0.4577893518518519 | 49.927 |
| 0.4578009259259259 | 49.929 |
| 0.4578125 | 49.93 |
| 0.45782407407407405 | 49.933 |
| 0.4578356481481482 | 49.935 |
| 0.45784722222222224 | 49.936 |
| 0.45785879629629633 | 49.939 |
| 0.45787037037037037 | 49.941 |
| 0.4578819444444444 | 49.942 |
| 0.4578935185185185 | 49.946 |
| 0.45790509259259254 | 49.948 |
| 0.4579166666666667 | 49.952 |
| 0.45792824074074073 | 49.955 |
| 0.4579398148148148 | 49.955 |
| 0.45795138888888887 | 49.958 |
| 0.45796296296296296 | 49.959 |
| 0.457974537037037 | 49.961 |
| 0.45798611111111115 | 49.958 |
| 0.4579976851851852 | 49.958 |
| 0.4580092592592593 | 49.956 |
| 0.4580208333333333 | 49.956 |
| 0.4580324074074074 | 49.954 |
| 0.45804398148148145 | 49.953 |
| 0.4580555555555556 | 49.952 |
| 0.45806712962962964 | 49.95 |
| 0.45807870370370374 | 49.948 |
| 0.4580902777777778 | 49.945 |
| 0.4581018518518518 | 49.942 |
| 0.4581134259259259 | 49.942 |
| 0.45812499999999995 | 49.941 |
| 0.4581365740740741 | 49.94 |
| 0.45814814814814814 | 49.94 |
| 0.45815972222222223 | 49.941 |
| 0.45817129629629627 | 49.941 |
| 0.45818287037037037 | 49.942 |
| 0.4581944444444444 | 49.942 |
| 0.45820601851851855 | 49.942 |
| 0.4582175925925926 | 49.942 |
| 0.4582291666666667 | 49.94 |
| 0.4582407407407407 | 49.94 |
| 0.4582523148148148 | 49.939 |
| 0.45826388888888886 | 49.939 |
| 0.458275462962963 | 49.939 |
| 0.45828703703703705 | 49.941 |
| 0.45829861111111114 | 49.943 |
| 0.4583101851851852 | 49.945 |
| 0.4583217592592593 | 49.947 |
| 0.4583333333333333 | 49.947 |
| 0.45834490740740735 | 49.945 |
| 0.4583564814814815 | 49.943 |
| 0.45836805555555554 | 49.942 |
| 0.45837962962962964 | 49.943 |
| 0.4583912037037037 | 49.946 |
| 0.45840277777777777 | 49.948 |
| 0.4584143518518518 | 49.951 |
| 0.45842592592592596 | 49.954 |
| 0.4584375 | 49.955 |
| 0.4584490740740741 | 49.957 |
| 0.45846064814814813 | 49.956 |
| 0.4584722222222222 | 49.957 |
| 0.45848379629629626 | 49.959 |
| 0.4584953703703704 | 49.96 |
| 0.45850694444444445 | 49.958 |
| 0.45851851851851855 | 49.959 |
| 0.4585300925925926 | 49.96 |
| 0.4585416666666667 | 49.961 |
| 0.4585532407407407 | 49.963 |
| 0.45856481481481487 | 49.963 |
| 0.4585763888888889 | 49.964 |
| 0.45858796296296295 | 49.963 |
| 0.45859953703703704 | 49.964 |
| 0.4586111111111111 | 49.966 |
| 0.4586226851851852 | 49.968 |
| 0.4586342592592592 | 49.966 |
| 0.45864583333333336 | 49.968 |
| 0.4586574074074074 | 49.97 |
| 0.4586689814814815 | 49.969 |
| 0.45868055555555554 | 49.968 |
| 0.45869212962962963 | 49.965 |
| 0.45870370370370367 | 49.964 |
| 0.4587152777777778 | 49.963 |
| 0.45872685185185186 | 49.961 |
| 0.45873842592592595 | 49.961 |
| 0.45875 | 49.962 |
| 0.4587615740740741 | 49.961 |
| 0.4587731481481481 | 49.96 |
| 0.4587847222222223 | 49.96 |
| 0.4587962962962963 | 49.959 |
| 0.45880787037037035 | 49.957 |
| 0.45881944444444445 | 49.957 |
| 0.4588310185185185 | 49.958 |
| 0.4588425925925926 | 49.957 |
| 0.4588541666666666 | 49.956 |
| 0.45886574074074077 | 49.956 |
| 0.4588773148148148 | 49.954 |
| 0.4588888888888889 | 49.953 |
| 0.45890046296296294 | 49.954 |
| 0.45891203703703703 | 49.952 |
| 0.4589236111111111 | 49.952 |
| 0.4589351851851852 | 49.952 |
| 0.45894675925925926 | 49.951 |
| 0.45895833333333336 | 49.949 |
| 0.4589699074074074 | 49.948 |
| 0.4589814814814815 | 49.95 |
| 0.45899305555555553 | 49.95 |
| 0.4590046296296297 | 49.952 |
| 0.4590162037037037 | 49.952 |
| 0.4590277777777778 | 49.954 |
| 0.45903935185185185 | 49.956 |
| 0.4590509259259259 | 49.958 |
| 0.4590625 | 49.959 |
| 0.459074074074074 | 49.96 |
| 0.4590856481481482 | 49.963 |
| 0.4590972222222222 | 49.964 |
| 0.4591087962962963 | 49.968 |
| 0.45912037037037035 | 49.97 |
| 0.45913194444444444 | 49.973 |
| 0.4591435185185185 | 49.975 |
| 0.45915509259259263 | 49.978 |
| 0.45916666666666667 | 49.98 |
| 0.45917824074074076 | 49.981 |
| 0.4591898148148148 | 49.981 |
| 0.4592013888888889 | 49.983 |
| 0.45921296296296293 | 49.981 |
| 0.4592245370370371 | 49.98 |
| 0.4592361111111111 | 49.979 |
| 0.4592476851851852 | 49.978 |
| 0.45925925925925926 | 49.978 |
| 0.45927083333333335 | 49.978 |
| 0.4592824074074074 | 49.98 |
| 0.45929398148148143 | 49.984 |
| 0.4593055555555556 | 49.985 |
| 0.4593171296296296 | 49.987 |
| 0.4593287037037037 | 49.987 |
| 0.45934027777777775 | 49.989 |
| 0.45935185185185184 | 49.989 |
| 0.4593634259259259 | 49.989 |
| 0.45937500000000003 | 49.99 |
| 0.45938657407407407 | 49.989 |
| 0.45939814814814817 | 49.988 |
| 0.4594097222222222 | 49.983 |
| 0.4594212962962963 | 49.982 |
| 0.45943287037037034 | 49.981 |
| 0.4594444444444445 | 49.978 |
| 0.4594560185185185 | 49.978 |
| 0.4594675925925926 | 49.976 |
| 0.45947916666666666 | 49.975 |
| 0.45949074074074076 | 49.975 |
| 0.4595023148148148 | 49.974 |
| 0.45951388888888894 | 49.974 |
| 0.459525462962963 | 49.974 |
| 0.459537037037037 | 49.976 |
| 0.4595486111111111 | 49.976 |
| 0.45956018518518515 | 49.978 |
| 0.45957175925925925 | 49.978 |
| 0.4595833333333333 | 49.979 |
| 0.45959490740740744 | 49.978 |
| 0.4596064814814815 | 49.977 |
| 0.45961805555555557 | 49.977 |
| 0.4596296296296296 | 49.976 |
| 0.4596412037037037 | 49.976 |
| 0.45965277777777774 | 49.976 |
| 0.4596643518518519 | 49.977 |
| 0.45967592592592593 | 49.978 |
| 0.4596875 | 49.979 |
| 0.45969907407407407 | 49.978 |
| 0.45971064814814816 | 49.979 |
| 0.4597222222222222 | 49.979 |
| 0.45973379629629635 | 49.979 |
| 0.4597453703703704 | 49.977 |
| 0.4597569444444444 | 49.976 |
| 0.4597685185185185 | 49.975 |
| 0.45978009259259256 | 49.972 |
| 0.45979166666666665 | 49.969 |
| 0.4598032407407407 | 49.966 |
| 0.45981481481481484 | 49.963 |
| 0.4598263888888889 | 49.962 |
| 0.459837962962963 | 49.961 |
| 0.459849537037037 | 49.961 |
| 0.4598611111111111 | 49.96 |
| 0.45987268518518515 | 49.956 |
| 0.4598842592592593 | 49.955 |
| 0.45989583333333334 | 49.955 |
| 0.45990740740740743 | 49.955 |
| 0.45991898148148147 | 49.957 |
| 0.45993055555555556 | 49.958 |
| 0.4599421296296296 | 49.96 |
| 0.45995370370370375 | 49.961 |
| 0.4599652777777778 | 49.962 |
| 0.4599768518518519 | 49.963 |
| 0.4599884259259259 | 49.964 |
| 0.45999999999999996 | 49.965 |
| 0.46001157407407406 | 49.967 |
| 0.4600231481481481 | 49.967 |
| 0.46003472222222225 | 49.965 |
| 0.4600462962962963 | 49.962 |
| 0.4600578703703704 | 49.961 |
| 0.4600694444444444 | 49.961 |
| 0.4600810185185185 | 49.959 |
| 0.46009259259259255 | 49.957 |
| 0.4601041666666667 | 49.956 |
| 0.46011574074074074 | 49.955 |
| 0.46012731481481484 | 49.953 |
| 0.4601388888888889 | 49.953 |
| 0.46015046296296297 | 49.951 |
| 0.460162037037037 | 49.953 |
| 0.46017361111111116 | 49.954 |
| 0.4601851851851852 | 49.954 |
| 0.4601967592592593 | 49.955 |
| 0.46020833333333333 | 49.957 |
| 0.4602199074074074 | 49.96 |
| 0.46023148148148146 | 49.963 |
| 0.4602430555555555 | 49.964 |
| 0.46025462962962965 | 49.967 |
| 0.4602662037037037 | 49.969 |
| 0.4602777777777778 | 49.971 |
| 0.4602893518518518 | 49.972 |
| 0.4603009259259259 | 49.974 |
| 0.46031249999999996 | 49.974 |
| 0.4603240740740741 | 49.974 |
| 0.46033564814814815 | 49.976 |
| 0.46034722222222224 | 49.975 |
| 0.4603587962962963 | 49.975 |
| 0.4603703703703704 | 49.975 |
| 0.4603819444444444 | 49.975 |
| 0.46039351851851856 | 49.975 |
| 0.4604050925925926 | 49.975 |
| 0.4604166666666667 | 49.976 |
| 0.46042824074074074 | 49.976 |
| 0.46043981481481483 | 49.976 |
| 0.46045138888888887 | 49.976 |
| 0.460462962962963 | 49.976 |
| 0.46047453703703706 | 49.978 |
| 0.4604861111111111 | 49.979 |
| 0.4604976851851852 | 49.978 |
| 0.46050925925925923 | 49.978 |
| 0.4605208333333333 | 49.978 |
| 0.46053240740740736 | 49.975 |
| 0.4605439814814815 | 49.974 |
| 0.46055555555555555 | 49.969 |
| 0.46056712962962965 | 49.967 |
| 0.4605787037037037 | 49.964 |
| 0.4605902777777778 | 49.963 |
| 0.4606018518518518 | 49.962 |
| 0.46061342592592597 | 49.961 |
| 0.460625 | 49.961 |
| 0.4606365740740741 | 49.963 |
| 0.46064814814814814 | 49.965 |
| 0.46065972222222223 | 49.967 |
| 0.4606712962962963 | 49.968 |
| 0.4606828703703704 | 49.97 |
| 0.46069444444444446 | 49.971 |
| 0.4607060185185185 | 49.973 |
| 0.4607175925925926 | 49.976 |
| 0.46072916666666663 | 49.98 |
| 0.46074074074074073 | 49.981 |
| 0.46075231481481477 | 49.983 |
| 0.4607638888888889 | 49.982 |
| 0.46077546296296296 | 49.98 |
| 0.46078703703703705 | 49.981 |
| 0.4607986111111111 | 49.978 |
| 0.4608101851851852 | 49.977 |
| 0.4608217592592592 | 49.976 |
| 0.4608333333333334 | 49.974 |
| 0.4608449074074074 | 49.973 |
| 0.4608564814814815 | 49.972 |
| 0.46086805555555554 | 49.97 |
| 0.46087962962962964 | 49.968 |
| 0.4608912037037037 | 49.969 |
| 0.46090277777777783 | 49.968 |
| 0.46091435185185187 | 49.968 |
| 0.46092592592592596 | 49.967 |
| 0.4609375 | 49.964 |
| 0.46094907407407404 | 49.964 |
| 0.46096064814814813 | 49.965 |
| 0.46097222222222217 | 49.965 |
| 0.4609837962962963 | 49.966 |
| 0.46099537037037036 | 49.967 |
| 0.46100694444444446 | 49.966 |
| 0.4610185185185185 | 49.963 |
| 0.4610300925925926 | 49.96 |
| 0.4610416666666666 | 49.957 |
| 0.4610532407407408 | 49.951 |
| 0.4610648148148148 | 49.945 |
| 0.4610763888888889 | 49.941 |
| 0.46108796296296295 | 49.937 |
| 0.46109953703703704 | 49.932 |
| 0.4611111111111111 | 49.926 |
| 0.46112268518518523 | 49.92 |
| 0.46113425925925927 | 49.916 |
| 0.46114583333333337 | 49.912 |
| 0.4611574074074074 | 49.909 |
| 0.4611689814814815 | 49.909 |
| 0.46118055555555554 | 49.908 |
| 0.4611921296296296 | 49.907 |
| 0.4612037037037037 | 49.909 |
| 0.46121527777777777 | 49.91 |
| 0.46122685185185186 | 49.909 |
| 0.4612384259259259 | 49.91 |
| 0.46125 | 49.91 |
| 0.46126157407407403 | 49.911 |
| 0.4612731481481482 | 49.912 |
| 0.4612847222222222 | 49.912 |
| 0.4612962962962963 | 49.911 |
| 0.46130787037037035 | 49.911 |
| 0.46131944444444445 | 49.911 |
| 0.4613310185185185 | 49.912 |
| 0.46134259259259264 | 49.913 |
| 0.4613541666666667 | 49.913 |
| 0.46136574074074077 | 49.913 |
| 0.4613773148148148 | 49.915 |
| 0.4613888888888889 | 49.915 |
| 0.46140046296296294 | 49.913 |
| 0.461412037037037 | 49.912 |
| 0.46142361111111113 | 49.912 |
| 0.46143518518518517 | 49.911 |
| 0.46144675925925926 | 49.908 |
| 0.4614583333333333 | 49.907 |
| 0.4614699074074074 | 49.903 |
| 0.46148148148148144 | 49.9 |
| 0.4614930555555556 | 49.898 |
| 0.4615046296296296 | 49.896 |
| 0.4615162037037037 | 49.893 |
| 0.46152777777777776 | 49.892 |
| 0.46153935185185185 | 49.889 |
| 0.4615509259259259 | 49.886 |
| 0.46156250000000004 | 49.885 |
| 0.4615740740740741 | 49.883 |
| 0.4615856481481482 | 49.883 |
| 0.4615972222222222 | 49.88 |
| 0.4616087962962963 | 49.876 |
| 0.46162037037037035 | 49.876 |
| 0.4616319444444445 | 49.877 |
| 0.46164351851851854 | 49.878 |
| 0.4616550925925926 | 49.877 |
| 0.46166666666666667 | 49.877 |
| 0.4616782407407407 | 49.877 |
| 0.4616898148148148 | 49.878 |
| 0.46170138888888884 | 49.878 |
| 0.461712962962963 | 49.877 |
| 0.46172453703703703 | 49.876 |
| 0.4617361111111111 | 49.875 |
| 0.46174768518518516 | 49.876 |
| 0.46175925925925926 | 49.876 |
| 0.4617708333333333 | 49.877 |
| 0.46178240740740745 | 49.875 |
| 0.4617939814814815 | 49.874 |
| 0.4618055555555556 | 49.874 |
| 0.4618171296296296 | 49.871 |
| 0.4618287037037037 | 49.871 |
| 0.46184027777777775 | 49.869 |
| 0.4618518518518519 | 49.867 |
| 0.46186342592592594 | 49.866 |
| 0.46187500000000004 | 49.863 |
| 0.4618865740740741 | 49.861 |
| 0.4618981481481481 | 49.859 |
| 0.4619097222222222 | 49.858 |
| 0.46192129629629625 | 49.857 |
| 0.4619328703703704 | 49.855 |
| 0.46194444444444444 | 49.853 |
| 0.46195601851851853 | 49.852 |
| 0.46196759259259257 | 49.85 |
| 0.46197916666666666 | 49.847 |
| 0.4619907407407407 | 49.844 |
| 0.46200231481481485 | 49.84 |
| 0.4620138888888889 | 49.839 |
| 0.462025462962963 | 49.837 |
| 0.462037037037037 | 49.836 |
| 0.4620486111111111 | 49.836 |
| 0.46206018518518516 | 49.837 |
| 0.4620717592592593 | 49.837 |
| 0.46208333333333335 | 49.838 |
| 0.46209490740740744 | 49.839 |
| 0.4621064814814815 | 49.841 |
| 0.4621180555555556 | 49.844 |
| 0.4621296296296296 | 49.844 |
| 0.46214120370370365 | 49.845 |
| 0.4621527777777778 | 49.846 |
| 0.46216435185185184 | 49.845 |
| 0.46217592592592593 | 49.844 |
| 0.4621875 | 49.844 |
| 0.46219907407407407 | 49.845 |
| 0.4622106481481481 | 49.846 |
| 0.46222222222222226 | 49.849 |
| 0.4622337962962963 | 49.85 |
| 0.4622453703703704 | 49.852 |
| 0.46225694444444443 | 49.852 |
| 0.4622685185185185 | 49.854 |
| 0.46228009259259256 | 49.853 |
| 0.4622916666666667 | 49.853 |
| 0.46230324074074075 | 49.853 |
| 0.46231481481481485 | 49.853 |
| 0.4623263888888889 | 49.853 |
| 0.462337962962963 | 49.85 |
| 0.462349537037037 | 49.851 |
| 0.46236111111111106 | 49.85 |
| 0.4623726851851852 | 49.853 |
| 0.46238425925925924 | 49.855 |
| 0.46239583333333334 | 49.856 |
| 0.4624074074074074 | 49.853 |
| 0.4624189814814815 | 49.854 |
| 0.4624305555555555 | 49.854 |
| 0.46244212962962966 | 49.853 |
| 0.4624537037037037 | 49.851 |
| 0.4624652777777778 | 49.851 |
| 0.46247685185185183 | 49.848 |
| 0.46248842592592593 | 49.847 |
| 0.46249999999999997 | 49.847 |
| 0.4625115740740741 | 49.848 |
| 0.46252314814814816 | 49.847 |
| 0.46253472222222225 | 49.849 |
| 0.4625462962962963 | 49.854 |
| 0.4625578703703704 | 49.858 |
| 0.4625694444444444 | 49.861 |
| 0.46258101851851857 | 49.866 |
| 0.4625925925925926 | 49.869 |
| 0.46260416666666665 | 49.874 |
| 0.46261574074074074 | 49.878 |
| 0.4626273148148148 | 49.882 |
| 0.4626388888888889 | 49.884 |
| 0.4626504629629629 | 49.884 |
| 0.46266203703703707 | 49.885 |
| 0.4626736111111111 | 49.884 |
| 0.4626851851851852 | 49.885 |
| 0.46269675925925924 | 49.886 |
| 0.46270833333333333 | 49.889 |
| 0.46271990740740737 | 49.893 |
| 0.4627314814814815 | 49.897 |
| 0.46274305555555556 | 49.899 |
| 0.46275462962962965 | 49.9 |
| 0.4627662037037037 | 49.902 |
| 0.4627777777777778 | 49.905 |
| 0.4627893518518518 | 49.907 |
| 0.462800925925926 | 49.91 |
| 0.4628125 | 49.91 |
| 0.4628240740740741 | 49.912 |
| 0.46283564814814815 | 49.912 |
| 0.4628472222222222 | 49.912 |
| 0.4628587962962963 | 49.914 |
| 0.4628703703703703 | 49.914 |
| 0.46288194444444447 | 49.915 |
| 0.4628935185185185 | 49.915 |
| 0.4629050925925926 | 49.918 |
| 0.46291666666666664 | 49.92 |
| 0.46292824074074074 | 49.92 |
| 0.4629398148148148 | 49.922 |
| 0.4629513888888889 | 49.924 |
| 0.46296296296296297 | 49.925 |
| 0.46297453703703706 | 49.926 |
| 0.4629861111111111 | 49.927 |
| 0.4629976851851852 | 49.931 |
| 0.46300925925925923 | 49.931 |
| 0.4630208333333334 | 49.932 |
| 0.4630324074074074 | 49.933 |
| 0.4630439814814815 | 49.933 |
| 0.46305555555555555 | 49.933 |
| 0.46306712962962965 | 49.932 |
| 0.4630787037037037 | 49.931 |
| 0.4630902777777777 | 49.929 |
| 0.4631018518518519 | 49.928 |
| 0.4631134259259259 | 49.927 |
| 0.463125 | 49.923 |
| 0.46313657407407405 | 49.921 |
| 0.46314814814814814 | 49.917 |
| 0.4631597222222222 | 49.916 |
| 0.46317129629629633 | 49.913 |
| 0.46318287037037037 | 49.91 |
| 0.46319444444444446 | 49.908 |
| 0.4632060185185185 | 49.906 |
| 0.4632175925925926 | 49.905 |
| 0.46322916666666664 | 49.905 |
| 0.4632407407407408 | 49.907 |
| 0.4632523148148148 | 49.906 |
| 0.4632638888888889 | 49.909 |
| 0.46327546296296296 | 49.91 |
| 0.46328703703703705 | 49.911 |
| 0.4632986111111111 | 49.912 |
| 0.46331018518518513 | 49.913 |
| 0.4633217592592593 | 49.912 |
| 0.4633333333333333 | 49.913 |
| 0.4633449074074074 | 49.91 |
| 0.46335648148148145 | 49.908 |
| 0.46336805555555555 | 49.906 |
| 0.4633796296296296 | 49.903 |
| 0.46339120370370374 | 49.9 |
| 0.4634027777777778 | 49.9 |
| 0.46341435185185187 | 49.898 |
| 0.4634259259259259 | 49.897 |
| 0.4634375 | 49.897 |
| 0.46344907407407404 | 49.897 |
| 0.4634606481481482 | 49.897 |
| 0.46347222222222223 | 49.899 |
| 0.4634837962962963 | 49.898 |
| 0.46349537037037036 | 49.898 |
| 0.46350694444444446 | 49.902 |
| 0.4635185185185185 | 49.905 |
| 0.46353009259259265 | 49.906 |
| 0.4635416666666667 | 49.908 |
| 0.4635532407407407 | 49.908 |
| 0.4635648148148148 | 49.91 |
| 0.46357638888888886 | 49.911 |
| 0.46358796296296295 | 49.914 |
| 0.463599537037037 | 49.914 |
| 0.46361111111111114 | 49.915 |
| 0.4636226851851852 | 49.915 |
| 0.4636342592592593 | 49.916 |
| 0.4636458333333333 | 49.915 |
| 0.4636574074074074 | 49.918 |
| 0.46366898148148145 | 49.919 |
| 0.4636805555555556 | 49.92 |
| 0.46369212962962963 | 49.919 |
| 0.46370370370370373 | 49.922 |
| 0.46371527777777777 | 49.922 |
| 0.46372685185185186 | 49.922 |
| 0.4637384259259259 | 49.924 |
| 0.46375000000000005 | 49.927 |
| 0.4637615740740741 | 49.929 |
| 0.4637731481481482 | 49.932 |
| 0.4637847222222222 | 49.934 |
| 0.46379629629629626 | 49.937 |
| 0.46380787037037036 | 49.938 |
| 0.4638194444444444 | 49.939 |
| 0.46383101851851855 | 49.94 |
| 0.4638425925925926 | 49.941 |
| 0.4638541666666667 | 49.94 |
| 0.4638657407407407 | 49.939 |
| 0.4638773148148148 | 49.94 |
| 0.46388888888888885 | 49.938 |
| 0.463900462962963 | 49.936 |
| 0.46391203703703704 | 49.933 |
| 0.46392361111111113 | 49.93 |
| 0.4639351851851852 | 49.927 |
| 0.46394675925925927 | 49.926 |
| 0.4639583333333333 | 49.926 |
| 0.46396990740740746 | 49.926 |
| 0.4639814814814815 | 49.924 |
| 0.4639930555555556 | 49.926 |
| 0.46400462962962963 | 49.926 |
| 0.46401620370370367 | 49.924 |
| 0.46402777777777776 | 49.927 |
| 0.4640393518518518 | 49.928 |
| 0.46405092592592595 | 49.929 |
| 0.4640625 | 49.932 |
| 0.4640740740740741 | 49.933 |
| 0.4640856481481481 | 49.933 |
| 0.4640972222222222 | 49.935 |
| 0.46410879629629626 | 49.937 |
| 0.4641203703703704 | 49.936 |
| 0.46413194444444444 | 49.934 |
| 0.46414351851851854 | 49.933 |
| 0.4641550925925926 | 49.93 |
| 0.46416666666666667 | 49.928 |
| 0.4641782407407407 | 49.924 |
| 0.46418981481481486 | 49.92 |
| 0.4642013888888889 | 49.917 |
| 0.464212962962963 | 49.916 |
| 0.46422453703703703 | 49.913 |
| 0.4642361111111111 | 49.913 |
| 0.46424768518518517 | 49.912 |
| 0.4642592592592592 | 49.911 |
| 0.46427083333333335 | 49.911 |
| 0.4642824074074074 | 49.911 |
| 0.4642939814814815 | 49.912 |
| 0.4643055555555555 | 49.91 |
| 0.4643171296296296 | 49.909 |
| 0.46432870370370366 | 49.908 |
| 0.4643402777777778 | 49.908 |
| 0.46435185185185185 | 49.907 |
| 0.46436342592592594 | 49.909 |
| 0.464375 | 49.911 |
| 0.4643865740740741 | 49.912 |
| 0.4643981481481481 | 49.913 |
| 0.46440972222222227 | 49.914 |
| 0.4644212962962963 | 49.914 |
| 0.4644328703703704 | 49.914 |
| 0.46444444444444444 | 49.914 |
| 0.46445601851851853 | 49.913 |
| 0.46446759259259257 | 49.913 |
| 0.4644791666666667 | 49.913 |
| 0.46449074074074076 | 49.913 |
| 0.4645023148148148 | 49.914 |
| 0.4645138888888889 | 49.917 |
| 0.46452546296296293 | 49.917 |
| 0.464537037037037 | 49.92 |
| 0.46454861111111106 | 49.92 |
| 0.4645601851851852 | 49.918 |
| 0.46457175925925925 | 49.919 |
| 0.46458333333333335 | 49.918 |
| 0.4645949074074074 | 49.916 |
| 0.4646064814814815 | 49.915 |
| 0.4646180555555555 | 49.915 |
| 0.46462962962962967 | 49.915 |
| 0.4646412037037037 | 49.915 |
| 0.4646527777777778 | 49.913 |
| 0.46466435185185184 | 49.911 |
| 0.46467592592592594 | 49.909 |
| 0.4646875 | 49.905 |
| 0.4646990740740741 | 49.901 |
| 0.46471064814814816 | 49.898 |
| 0.4647222222222222 | 49.896 |
| 0.4647337962962963 | 49.894 |
| 0.46474537037037034 | 49.891 |
| 0.46475694444444443 | 49.89 |
| 0.46476851851851847 | 49.888 |
| 0.4647800925925926 | 49.888 |
| 0.46479166666666666 | 49.886 |
| 0.46480324074074075 | 49.886 |
| 0.4648148148148148 | 49.885 |
| 0.4648263888888889 | 49.884 |
| 0.4648379629629629 | 49.884 |
| 0.4648495370370371 | 49.886 |
| 0.4648611111111111 | 49.885 |
| 0.4648726851851852 | 49.887 |
| 0.46488425925925925 | 49.889 |
| 0.46489583333333334 | 49.888 |
| 0.4649074074074074 | 49.891 |
| 0.46491898148148153 | 49.894 |
| 0.46493055555555557 | 49.895 |
| 0.46494212962962966 | 49.896 |
| 0.4649537037037037 | 49.896 |
| 0.4649652777777778 | 49.897 |
| 0.46497685185185184 | 49.896 |
| 0.4649884259259259 | 49.896 |
| 0.465 | 49.895 |
| 0.46501157407407406 | 49.895 |
| 0.46502314814814816 | 49.896 |
| 0.4650347222222222 | 49.896 |
| 0.4650462962962963 | 49.898 |
| 0.46505787037037033 | 49.901 |
| 0.4650694444444445 | 49.903 |
| 0.4650810185185185 | 49.906 |
| 0.4650925925925926 | 49.907 |
| 0.46510416666666665 | 49.908 |
| 0.46511574074074075 | 49.908 |
| 0.4651273148148148 | 49.91 |
| 0.46513888888888894 | 49.913 |
| 0.465150462962963 | 49.913 |
| 0.46516203703703707 | 49.913 |
| 0.4651736111111111 | 49.913 |
| 0.4651851851851852 | 49.913 |
| 0.46519675925925924 | 49.914 |
| 0.4652083333333333 | 49.916 |
| 0.46521990740740743 | 49.919 |
| 0.46523148148148147 | 49.919 |
| 0.46524305555555556 | 49.92 |
| 0.4652546296296296 | 49.919 |
| 0.4652662037037037 | 49.92 |
| 0.46527777777777773 | 49.921 |
| 0.4652893518518519 | 49.921 |
| 0.4653009259259259 | 49.92 |
| 0.4653125 | 49.919 |
| 0.46532407407407406 | 49.918 |
| 0.46533564814814815 | 49.919 |
| 0.4653472222222222 | 49.919 |
| 0.46535879629629634 | 49.919 |
| 0.4653703703703704 | 49.92 |
| 0.4653819444444445 | 49.919 |
| 0.4653935185185185 | 49.919 |
| 0.4654050925925926 | 49.921 |
| 0.46541666666666665 | 49.922 |
| 0.4654282407407408 | 49.925 |
| 0.46543981481481483 | 49.927 |
| 0.4654513888888889 | 49.929 |
| 0.46546296296296297 | 49.932 |
| 0.465474537037037 | 49.931 |
| 0.4654861111111111 | 49.933 |
| 0.46549768518518514 | 49.933 |
| 0.4655092592592593 | 49.931 |
| 0.46552083333333333 | 49.929 |
| 0.4655324074074074 | 49.927 |
| 0.46554398148148146 | 49.925 |
| 0.46555555555555556 | 49.923 |
| 0.4655671296296296 | 49.923 |
| 0.46557870370370374 | 49.924 |
| 0.4655902777777778 | 49.923 |
| 0.4656018518518519 | 49.922 |
| 0.4656134259259259 | 49.92 |
| 0.465625 | 49.92 |
| 0.46563657407407405 | 49.918 |
| 0.4656481481481482 | 49.917 |
| 0.46565972222222224 | 49.918 |
| 0.46567129629629633 | 49.918 |
| 0.46568287037037037 | 49.919 |
| 0.4656944444444444 | 49.918 |
| 0.4657060185185185 | 49.919 |
| 0.46571759259259254 | 49.918 |
| 0.4657291666666667 | 49.919 |
| 0.46574074074074073 | 49.919 |
| 0.4657523148148148 | 49.918 |
| 0.46576388888888887 | 49.918 |
| 0.46577546296296296 | 49.914 |
| 0.465787037037037 | 49.91 |
| 0.46579861111111115 | 49.906 |
| 0.4658101851851852 | 49.902 |
| 0.4658217592592593 | 49.9 |
| 0.4658333333333333 | 49.9 |
| 0.4658449074074074 | 49.898 |
| 0.46585648148148145 | 49.896 |
| 0.4658680555555556 | 49.895 |
| 0.46587962962962964 | 49.895 |
| 0.46589120370370374 | 49.89 |
| 0.4659027777777778 | 49.891 |
| 0.4659143518518518 | 49.891 |
| 0.4659259259259259 | 49.89 |
| 0.46593749999999995 | 49.888 |
| 0.4659490740740741 | 49.887 |
| 0.46596064814814814 | 49.886 |
| 0.46597222222222223 | 49.885 |
| 0.46598379629629627 | 49.886 |
| 0.46599537037037037 | 49.886 |
| 0.4660069444444444 | 49.887 |
| 0.46601851851851855 | 49.886 |
| 0.4660300925925926 | 49.884 |
| 0.4660416666666667 | 49.885 |
| 0.4660532407407407 | 49.885 |
| 0.4660648148148148 | 49.884 |
| 0.46607638888888886 | 49.884 |
| 0.466087962962963 | 49.885 |
| 0.46609953703703705 | 49.885 |
| 0.46611111111111114 | 49.886 |
| 0.4661226851851852 | 49.887 |
| 0.4661342592592593 | 49.888 |
| 0.4661458333333333 | 49.891 |
| 0.46615740740740735 | 49.894 |
| 0.4661689814814815 | 49.896 |
| 0.46618055555555554 | 49.899 |
| 0.46619212962962964 | 49.899 |
| 0.4662037037037037 | 49.899 |
| 0.46621527777777777 | 49.899 |
| 0.4662268518518518 | 49.898 |
| 0.46623842592592596 | 49.898 |
| 0.46625 | 49.898 |
| 0.4662615740740741 | 49.898 |
| 0.46627314814814813 | 49.898 |
| 0.4662847222222222 | 49.898 |
| 0.46629629629629626 | 49.898 |
| 0.4663078703703704 | 49.898 |
| 0.46631944444444445 | 49.899 |
| 0.46633101851851855 | 49.9 |
| 0.4663425925925926 | 49.9 |
| 0.4663541666666667 | 49.901 |
| 0.4663657407407407 | 49.902 |
| 0.46637731481481487 | 49.902 |
| 0.4663888888888889 | 49.904 |
| 0.46640046296296295 | 49.903 |
| 0.46641203703703704 | 49.904 |
| 0.4664236111111111 | 49.904 |
| 0.4664351851851852 | 49.903 |
| 0.4664467592592592 | 49.903 |
| 0.46645833333333336 | 49.903 |
| 0.4664699074074074 | 49.904 |
| 0.4664814814814815 | 49.905 |
| 0.46649305555555554 | 49.907 |
| 0.46650462962962963 | 49.908 |
| 0.46651620370370367 | 49.908 |
| 0.4665277777777778 | 49.909 |
| 0.46653935185185186 | 49.911 |
| 0.46655092592592595 | 49.912 |
| 0.4665625 | 49.912 |
| 0.4665740740740741 | 49.912 |
| 0.4665856481481481 | 49.914 |
| 0.4665972222222223 | 49.915 |
| 0.4666087962962963 | 49.915 |
| 0.46662037037037035 | 49.914 |
| 0.46663194444444445 | 49.913 |
| 0.4666435185185185 | 49.909 |
| 0.4666550925925926 | 49.906 |
| 0.4666666666666666 | 49.905 |
| 0.46667824074074077 | 49.903 |
| 0.4666898148148148 | 49.9 |
| 0.4667013888888889 | 49.899 |
| 0.46671296296296294 | 49.898 |
| 0.46672453703703703 | 49.898 |
| 0.4667361111111111 | 49.899 |
| 0.4667476851851852 | 49.9 |
| 0.46675925925925926 | 49.901 |
| 0.46677083333333336 | 49.904 |
| 0.4667824074074074 | 49.908 |
| 0.4667939814814815 | 49.908 |
| 0.46680555555555553 | 49.911 |
| 0.4668171296296297 | 49.911 |
| 0.4668287037037037 | 49.912 |
| 0.4668402777777778 | 49.913 |
| 0.46685185185185185 | 49.912 |
| 0.4668634259259259 | 49.914 |
| 0.466875 | 49.915 |
| 0.466886574074074 | 49.916 |
| 0.4668981481481482 | 49.914 |
| 0.4669097222222222 | 49.912 |
| 0.4669212962962963 | 49.91 |
| 0.46693287037037035 | 49.909 |
| 0.46694444444444444 | 49.908 |
| 0.4669560185185185 | 49.906 |
| 0.46696759259259263 | 49.906 |
| 0.46697916666666667 | 49.907 |
| 0.46699074074074076 | 49.906 |
| 0.4670023148148148 | 49.906 |
| 0.4670138888888889 | 49.906 |
| 0.46702546296296293 | 49.905 |
| 0.4670370370370371 | 49.906 |
| 0.4670486111111111 | 49.909 |
| 0.4670601851851852 | 49.911 |
| 0.46707175925925926 | 49.914 |
| 0.46708333333333335 | 49.917 |
| 0.4670949074074074 | 49.919 |
| 0.46710648148148143 | 49.918 |
| 0.4671180555555556 | 49.919 |
| 0.4671296296296296 | 49.92 |
| 0.4671412037037037 | 49.92 |
| 0.46715277777777775 | 49.919 |
| 0.46716435185185184 | 49.918 |
| 0.4671759259259259 | 49.917 |
| 0.46718750000000003 | 49.915 |
| 0.46719907407407407 | 49.914 |
| 0.46721064814814817 | 49.912 |
| 0.4672222222222222 | 49.911 |
| 0.4672337962962963 | 49.91 |
| 0.46724537037037034 | 49.909 |
| 0.4672569444444445 | 49.908 |
| 0.4672685185185185 | 49.908 |
| 0.4672800925925926 | 49.91 |
| 0.46729166666666666 | 49.912 |
| 0.46730324074074076 | 49.915 |
| 0.4673148148148148 | 49.916 |
| 0.46732638888888883 | 49.919 |
| 0.467337962962963 | 49.919 |
| 0.467349537037037 | 49.92 |
| 0.4673611111111111 | 49.919 |
| 0.46737268518518515 | 49.918 |
| 0.46738425925925925 | 49.916 |
| 0.4673958333333333 | 49.916 |
| 0.46740740740740744 | 49.913 |
| 0.4674189814814815 | 49.915 |
| 0.46743055555555557 | 49.914 |
| 0.4674421296296296 | 49.915 |
| 0.4674537037037037 | 49.915 |
| 0.46746527777777774 | 49.915 |
| 0.4674768518518519 | 49.915 |
| 0.46748842592592593 | 49.914 |
| 0.4675 | 49.915 |
| 0.46751157407407407 | 49.913 |
| 0.46752314814814816 | 49.913 |
| 0.4675347222222222 | 49.911 |
| 0.46754629629629635 | 49.91 |
| 0.4675578703703704 | 49.91 |
| 0.4675694444444445 | 49.91 |
| 0.4675810185185185 | 49.908 |
| 0.46759259259259256 | 49.907 |
| 0.46760416666666665 | 49.905 |
| 0.4676157407407407 | 49.903 |
| 0.46762731481481484 | 49.899 |
| 0.4676388888888889 | 49.899 |
| 0.467650462962963 | 49.899 |
| 0.467662037037037 | 49.898 |
| 0.4676736111111111 | 49.897 |
| 0.46768518518518515 | 49.901 |
| 0.4676967592592593 | 49.902 |
| 0.46770833333333334 | 49.903 |
| 0.46771990740740743 | 49.903 |
| 0.46773148148148147 | 49.904 |
| 0.46774305555555556 | 49.903 |
| 0.4677546296296296 | 49.904 |
| 0.46776620370370375 | 49.906 |
| 0.4677777777777778 | 49.908 |
| 0.4677893518518519 | 49.911 |
| 0.4678009259259259 | 49.914 |
| 0.46781249999999996 | 49.919 |
| 0.46782407407407406 | 49.923 |
| 0.4678356481481481 | 49.928 |
| 0.46784722222222225 | 49.934 |
| 0.4678587962962963 | 49.94 |
| 0.4678703703703704 | 49.946 |
| 0.4678819444444444 | 49.952 |
| 0.4678935185185185 | 49.957 |
| 0.46790509259259255 | 49.963 |
| 0.4679166666666667 | 49.969 |
| 0.46792824074074074 | 49.974 |
| 0.46793981481481484 | 49.982 |
| 0.4679513888888889 | 49.988 |
| 0.46796296296296297 | 49.994 |
| 0.467974537037037 | 49.999 |
| 0.46798611111111116 | 50.005 |
| 0.4679976851851852 | 50.007 |
| 0.4680092592592593 | 50.007 |
| 0.46802083333333333 | 50.001 |
| 0.4680324074074074 | 49.995 |
| 0.46804398148148146 | 49.99 |
| 0.4680555555555555 | 49.981 |
| 0.46806712962962965 | 49.973 |
| 0.4680787037037037 | 49.966 |
| 0.4680902777777778 | 49.962 |
| 0.4681018518518518 | 49.957 |
| 0.4681134259259259 | 49.956 |
| 0.46812499999999996 | 49.955 |
| 0.4681365740740741 | 49.952 |
| 0.46814814814814815 | 49.951 |
| 0.46815972222222224 | 49.951 |
| 0.4681712962962963 | 49.952 |
| 0.4681828703703704 | 49.953 |
| 0.4681944444444444 | 49.952 |
| 0.46820601851851856 | 49.953 |
| 0.4682175925925926 | 49.952 |
| 0.4682291666666667 | 49.951 |
| 0.46824074074074074 | 49.952 |
| 0.46825231481481483 | 49.953 |
| 0.46826388888888887 | 49.954 |
| 0.468275462962963 | 49.954 |
| 0.46828703703703706 | 49.955 |
| 0.4682986111111111 | 49.956 |
| 0.4683101851851852 | 49.956 |
| 0.46832175925925923 | 49.955 |
| 0.4683333333333333 | 49.953 |
| 0.46834490740740736 | 49.953 |
| 0.4683564814814815 | 49.952 |
| 0.46836805555555555 | 49.952 |
| 0.46837962962962965 | 49.953 |
| 0.4683912037037037 | 49.953 |
| 0.4684027777777778 | 49.953 |
| 0.4684143518518518 | 49.954 |
| 0.46842592592592597 | 49.956 |
| 0.4684375 | 49.957 |
| 0.4684490740740741 | 49.959 |
| 0.46846064814814814 | 49.96 |
| 0.46847222222222223 | 49.96 |
| 0.4684837962962963 | 49.96 |
| 0.4684953703703704 | 49.959 |
| 0.46850694444444446 | 49.957 |
| 0.4685185185185185 | 49.957 |
| 0.4685300925925926 | 49.956 |
| 0.46854166666666663 | 49.955 |
| 0.46855324074074073 | 49.954 |
| 0.46856481481481477 | 49.954 |
| 0.4685763888888889 | 49.951 |
| 0.46858796296296296 | 49.95 |
| 0.46859953703703705 | 49.949 |
| 0.4686111111111111 | 49.948 |
| 0.4686226851851852 | 49.947 |
| 0.4686342592592592 | 49.948 |
| 0.4686458333333334 | 49.948 |
| 0.4686574074074074 | 49.949 |
| 0.4686689814814815 | 49.95 |
| 0.46868055555555554 | 49.952 |
| 0.46869212962962964 | 49.953 |
| 0.4687037037037037 | 49.955 |
| 0.46871527777777783 | 49.955 |
| 0.46872685185185187 | 49.954 |
| 0.46873842592592596 | 49.951 |
| 0.46875 | 49.951 |
| 0.46876157407407404 | 49.949 |
| 0.46877314814814813 | 49.948 |
| 0.46878472222222217 | 49.946 |
| 0.4687962962962963 | 49.948 |
| 0.46880787037037036 | 49.948 |
| 0.46881944444444446 | 49.949 |
| 0.4688310185185185 | 49.95 |
| 0.4688425925925926 | 49.952 |
| 0.4688541666666666 | 49.952 |
| 0.4688657407407408 | 49.953 |
| 0.4688773148148148 | 49.953 |
| 0.4688888888888889 | 49.954 |
| 0.46890046296296295 | 49.952 |
| 0.46891203703703704 | 49.953 |
| 0.4689236111111111 | 49.953 |
| 0.46893518518518523 | 49.954 |
| 0.46894675925925927 | 49.954 |
| 0.46895833333333337 | 49.955 |
| 0.4689699074074074 | 49.956 |
| 0.4689814814814815 | 49.958 |
| 0.46899305555555554 | 49.959 |
| 0.4690046296296296 | 49.961 |
| 0.4690162037037037 | 49.962 |
| 0.46902777777777777 | 49.965 |
| 0.46903935185185186 | 49.967 |
| 0.4690509259259259 | 49.969 |
| 0.4690625 | 49.969 |
| 0.46907407407407403 | 49.971 |
| 0.4690856481481482 | 49.972 |
| 0.4690972222222222 | 49.973 |
| 0.4691087962962963 | 49.973 |
| 0.46912037037037035 | 49.974 |
| 0.46913194444444445 | 49.977 |
| 0.4691435185185185 | 49.976 |
| 0.46915509259259264 | 49.976 |
| 0.4691666666666667 | 49.975 |
| 0.46917824074074077 | 49.975 |
| 0.4691898148148148 | 49.974 |
| 0.4692013888888889 | 49.975 |
| 0.46921296296296294 | 49.976 |
| 0.469224537037037 | 49.978 |
| 0.46923611111111113 | 49.977 |
| 0.46924768518518517 | 49.976 |
| 0.46925925925925926 | 49.974 |
| 0.4692708333333333 | 49.974 |
| 0.4692824074074074 | 49.975 |
| 0.46929398148148144 | 49.976 |
| 0.4693055555555556 | 49.977 |
| 0.4693171296296296 | 49.977 |
| 0.4693287037037037 | 49.976 |
| 0.46934027777777776 | 49.976 |
| 0.46935185185185185 | 49.976 |
| 0.4693634259259259 | 49.978 |
| 0.46937500000000004 | 49.978 |
| 0.4693865740740741 | 49.979 |
| 0.4693981481481482 | 49.981 |
| 0.4694097222222222 | 49.981 |
| 0.4694212962962963 | 49.98 |
| 0.46943287037037035 | 49.979 |
| 0.4694444444444445 | 49.979 |
| 0.46945601851851854 | 49.978 |
| 0.46946759259259263 | 49.979 |
| 0.46947916666666667 | 49.979 |
| 0.4694907407407407 | 49.979 |
| 0.4695023148148148 | 49.978 |
| 0.46951388888888884 | 49.977 |
| 0.469525462962963 | 49.976 |
| 0.46953703703703703 | 49.977 |
| 0.4695486111111111 | 49.975 |
| 0.46956018518518516 | 49.976 |
| 0.46957175925925926 | 49.977 |
| 0.4695833333333333 | 49.979 |
| 0.46959490740740745 | 49.98 |
| 0.4696064814814815 | 49.98 |
| 0.4696180555555556 | 49.981 |
| 0.4696296296296296 | 49.981 |
| 0.4696412037037037 | 49.981 |
| 0.46965277777777775 | 49.982 |
| 0.4696643518518519 | 49.984 |
| 0.46967592592592594 | 49.983 |
| 0.46968750000000004 | 49.982 |
| 0.4696990740740741 | 49.981 |
| 0.4697106481481481 | 49.981 |
| 0.4697222222222222 | 49.983 |
| 0.46973379629629625 | 49.985 |
| 0.4697453703703704 | 49.988 |
| 0.46975694444444444 | 49.989 |
| 0.46976851851851853 | 49.99 |
| 0.46978009259259257 | 49.993 |
| 0.46979166666666666 | 49.995 |
| 0.4698032407407407 | 49.996 |
| 0.46981481481481485 | 49.998 |
| 0.4698263888888889 | 49.998 |
| 0.469837962962963 | 49.997 |
| 0.469849537037037 | 49.997 |
| 0.4698611111111111 | 50 |
| 0.46987268518518516 | 50.004 |
| 0.4698842592592593 | 50.005 |
| 0.46989583333333335 | 50.004 |
| 0.46990740740740744 | 50.005 |
| 0.4699189814814815 | 50.008 |
| 0.4699305555555555 | 50.005 |
| 0.4699421296296296 | 50.003 |
| 0.46995370370370365 | 50.003 |
| 0.4699652777777778 | 50.004 |
| 0.46997685185185184 | 50.005 |
| 0.46998842592592593 | 50.004 |
| 0.47 | 50.005 |
| 0.47001157407407407 | 50.006 |
| 0.4700231481481481 | 50.01 |
| 0.47003472222222226 | 50.013 |
| 0.4700462962962963 | 50.017 |
| 0.4700578703703704 | 50.022 |
| 0.47006944444444443 | 50.026 |
| 0.4700810185185185 | 50.03 |
| 0.47009259259259256 | 50.034 |
| 0.4701041666666667 | 50.036 |
| 0.47011574074074075 | 50.037 |
| 0.47012731481481485 | 50.039 |